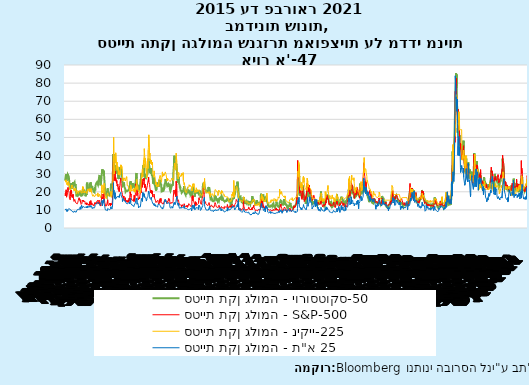
| Category | סטיית תקן גלומה - יורוסטוקס-50 | סטיית תקן גלומה - S&P-500 | סטיית תקן גלומה - ניקיי-225 | סטיית תקן גלומה - ת"א 25 |
|---|---|---|---|---|
| 2015-01-01 | 26.188 | 19.2 | 26.36 | 10.04 |
| 2015-01-02 | 26.253 | 17.79 | 26.36 | 10.04 |
| 2015-01-03 | 26.253 | 17.79 | 26.36 | 10.04 |
| 2015-01-04 | 26.253 | 17.79 | 26.36 | 10.18 |
| 2015-01-05 | 29.624 | 19.92 | 25.28 | 10.58 |
| 2015-01-06 | 28.832 | 21.12 | 26.59 | 10.55 |
| 2015-01-07 | 28.172 | 19.31 | 25.97 | 10.04 |
| 2015-01-08 | 25.909 | 17.01 | 25.05 | 9.17 |
| 2015-01-09 | 28.779 | 17.55 | 23.96 | 9.17 |
| 2015-01-10 | 28.779 | 17.55 | 23.96 | 9.17 |
| 2015-01-11 | 28.779 | 17.55 | 23.96 | 9.37 |
| 2015-01-12 | 29.725 | 19.6 | 23.96 | 10.04 |
| 2015-01-13 | 28.54 | 20.56 | 24.39 | 9.2 |
| 2015-01-14 | 29.484 | 21.48 | 25.18 | 9.57 |
| 2015-01-15 | 29.026 | 22.39 | 23.55 | 10.13 |
| 2015-01-16 | 29.329 | 20.95 | 25.68 | 10.13 |
| 2015-01-17 | 29.329 | 20.95 | 25.68 | 10.13 |
| 2015-01-18 | 29.329 | 20.95 | 25.68 | 9.73 |
| 2015-01-19 | 28.32 | 20.95 | 25.16 | 10.73 |
| 2015-01-20 | 27.072 | 19.89 | 24.74 | 10.74 |
| 2015-01-21 | 26.018 | 18.85 | 24.77 | 10.63 |
| 2015-01-22 | 22.944 | 16.4 | 24.14 | 10.35 |
| 2015-01-23 | 23.112 | 16.66 | 22.13 | 10.35 |
| 2015-01-24 | 23.112 | 16.66 | 22.13 | 10.35 |
| 2015-01-25 | 23.112 | 16.66 | 22.13 | 10.71 |
| 2015-01-26 | 21.343 | 15.52 | 21.99 | 10.47 |
| 2015-01-27 | 22.43 | 17.22 | 20.99 | 10.51 |
| 2015-01-28 | 21.826 | 20.44 | 20.54 | 10.45 |
| 2015-01-29 | 23.324 | 18.76 | 21.53 | 9.96 |
| 2015-01-30 | 24.731 | 20.97 | 21.63 | 9.96 |
| 2015-01-31 | 24.731 | 20.97 | 21.63 | 9.96 |
| 2015-02-01 | 24.731 | 20.97 | 21.63 | 9.86 |
| 2015-02-02 | 24.321 | 19.43 | 22.95 | 9.83 |
| 2015-02-03 | 22.764 | 17.33 | 23.75 | 9.27 |
| 2015-02-04 | 22.274 | 18.33 | 22.25 | 9.18 |
| 2015-02-05 | 22.261 | 16.85 | 22.69 | 8.88 |
| 2015-02-06 | 21.833 | 17.29 | 22.33 | 8.88 |
| 2015-02-07 | 21.833 | 17.29 | 22.33 | 8.88 |
| 2015-02-08 | 21.833 | 17.29 | 22.33 | 8.92 |
| 2015-02-09 | 25.371 | 18.55 | 22.33 | 9.14 |
| 2015-02-10 | 25.107 | 17.23 | 22.38 | 8.73 |
| 2015-02-11 | 25.721 | 16.96 | 22.53 | 8.54 |
| 2015-02-12 | 24.364 | 15.34 | 22.11 | 8.7 |
| 2015-02-13 | 24.185 | 14.69 | 20.53 | 8.7 |
| 2015-02-14 | 24.185 | 14.69 | 20.53 | 8.7 |
| 2015-02-15 | 24.185 | 14.69 | 20.53 | 8.3 |
| 2015-02-16 | 25.251 | 14.69 | 21.65 | 9.44 |
| 2015-02-17 | 24.905 | 15.8 | 21.23 | 9.8 |
| 2015-02-18 | 23.339 | 15.45 | 20.49 | 9.41 |
| 2015-02-19 | 23.209 | 15.29 | 20.93 | 8.84 |
| 2015-02-20 | 24.204 | 14.3 | 21.9 | 8.84 |
| 2015-02-21 | 24.204 | 14.3 | 21.9 | 8.84 |
| 2015-02-22 | 24.204 | 14.3 | 21.9 | 9.06 |
| 2015-02-23 | 20.625 | 14.56 | 21.77 | 9.1 |
| 2015-02-24 | 18.398 | 13.69 | 19.93 | 8.79 |
| 2015-02-25 | 17.824 | 13.84 | 18.78 | 8.5 |
| 2015-02-26 | 17.352 | 13.91 | 19.45 | 9.43 |
| 2015-02-27 | 17.753 | 13.34 | 20.28 | 9.43 |
| 2015-02-28 | 17.753 | 13.34 | 20.28 | 9.43 |
| 2015-03-01 | 17.753 | 13.34 | 20.28 | 10.09 |
| 2015-03-02 | 17.799 | 13.04 | 20.4 | 9.71 |
| 2015-03-03 | 19.584 | 13.86 | 20.07 | 10.49 |
| 2015-03-04 | 18.919 | 14.23 | 20.6 | 10.35 |
| 2015-03-05 | 18.184 | 14.04 | 19.85 | 10.35 |
| 2015-03-06 | 18.415 | 15.2 | 19.11 | 10.35 |
| 2015-03-07 | 18.415 | 15.2 | 19.11 | 10.35 |
| 2015-03-08 | 18.415 | 15.2 | 19.11 | 10.61 |
| 2015-03-09 | 18.811 | 15.06 | 19.58 | 10.52 |
| 2015-03-10 | 20.465 | 16.69 | 20.49 | 10.58 |
| 2015-03-11 | 19.47 | 16.87 | 20.82 | 10.09 |
| 2015-03-12 | 18.967 | 15.42 | 20.12 | 10.72 |
| 2015-03-13 | 18.826 | 16 | 20.21 | 10.72 |
| 2015-03-14 | 18.826 | 16 | 20.21 | 10.72 |
| 2015-03-15 | 18.826 | 16 | 20.21 | 11.23 |
| 2015-03-16 | 19.389 | 15.61 | 20.6 | 11.71 |
| 2015-03-17 | 20.248 | 15.66 | 20.24 | 11.71 |
| 2015-03-18 | 19.694 | 13.97 | 20.8 | 10.31 |
| 2015-03-19 | 18.914 | 14.07 | 20.29 | 11.11 |
| 2015-03-20 | 17.477 | 13.02 | 19.32 | 11.11 |
| 2015-03-21 | 17.477 | 13.02 | 19.32 | 11.11 |
| 2015-03-22 | 17.477 | 13.02 | 19.32 | 12.54 |
| 2015-03-23 | 19.832 | 13.41 | 19.45 | 12.53 |
| 2015-03-24 | 17.668 | 13.62 | 19.86 | 11.64 |
| 2015-03-25 | 19.158 | 15.44 | 19.3 | 10.89 |
| 2015-03-26 | 19.654 | 15.8 | 21.24 | 11.36 |
| 2015-03-27 | 20.472 | 15.07 | 22.86 | 11.36 |
| 2015-03-28 | 20.472 | 15.07 | 22.86 | 11.36 |
| 2015-03-29 | 20.472 | 15.07 | 22.86 | 11.31 |
| 2015-03-30 | 19.761 | 14.51 | 21.48 | 11.94 |
| 2015-03-31 | 21.1 | 15.29 | 22.71 | 11.94 |
| 2015-04-01 | 20.969 | 15.11 | 22.53 | 11.81 |
| 2015-04-02 | 20.72 | 14.67 | 20.76 | 11.42 |
| 2015-04-03 | 20.72 | 14.67 | 19.37 | 11.42 |
| 2015-04-04 | 20.72 | 14.67 | 19.37 | 11.42 |
| 2015-04-05 | 20.72 | 14.67 | 19.37 | 11.81 |
| 2015-04-06 | 20.72 | 14.74 | 20.41 | 11.73 |
| 2015-04-07 | 20.056 | 14.78 | 19.97 | 11.03 |
| 2015-04-08 | 19.428 | 13.98 | 19.55 | 11.4 |
| 2015-04-09 | 18.314 | 13.09 | 19.32 | 11.4 |
| 2015-04-10 | 17.512 | 12.58 | 20.05 | 11.4 |
| 2015-04-11 | 17.512 | 12.58 | 20.05 | 11.4 |
| 2015-04-12 | 17.512 | 12.58 | 20.05 | 11.39 |
| 2015-04-13 | 17.864 | 13.94 | 20.27 | 11.47 |
| 2015-04-14 | 18.858 | 13.67 | 20.37 | 11.74 |
| 2015-04-15 | 18.207 | 12.84 | 19.75 | 11.86 |
| 2015-04-16 | 20.109 | 12.6 | 19.13 | 11.05 |
| 2015-04-17 | 25.055 | 13.89 | 19.73 | 11.05 |
| 2015-04-18 | 25.055 | 13.89 | 19.73 | 11.05 |
| 2015-04-19 | 25.055 | 13.89 | 19.73 | 12.18 |
| 2015-04-20 | 22.3 | 13.3 | 21.06 | 11.28 |
| 2015-04-21 | 22.399 | 13.25 | 20.34 | 11.48 |
| 2015-04-22 | 22.327 | 12.71 | 21.49 | 11.48 |
| 2015-04-23 | 22.572 | 12.48 | 21.45 | 11.48 |
| 2015-04-24 | 21.92 | 12.29 | 20.99 | 11.48 |
| 2015-04-25 | 21.92 | 12.29 | 20.99 | 11.48 |
| 2015-04-26 | 21.92 | 12.29 | 20.99 | 11.85 |
| 2015-04-27 | 20.886 | 13.12 | 20.99 | 12.02 |
| 2015-04-28 | 22.12 | 12.41 | 21.71 | 12.25 |
| 2015-04-29 | 24.047 | 13.39 | 21.08 | 11.59 |
| 2015-04-30 | 24.213 | 14.55 | 21.29 | 11.62 |
| 2015-05-01 | 24.213 | 12.7 | 19.91 | 11.62 |
| 2015-05-02 | 24.213 | 12.7 | 19.91 | 11.62 |
| 2015-05-03 | 24.213 | 12.7 | 19.91 | 11.87 |
| 2015-05-04 | 23.426 | 12.85 | 21.08 | 11.56 |
| 2015-05-05 | 25.224 | 14.31 | 21.29 | 12.04 |
| 2015-05-06 | 24.723 | 15.15 | 19.91 | 12.42 |
| 2015-05-07 | 23.753 | 15.13 | 21.77 | 11.55 |
| 2015-05-08 | 21.13 | 12.86 | 20.57 | 11.55 |
| 2015-05-09 | 21.13 | 12.86 | 20.57 | 11.55 |
| 2015-05-10 | 21.13 | 12.86 | 20.57 | 11.1 |
| 2015-05-11 | 21.836 | 13.85 | 19.18 | 11.32 |
| 2015-05-12 | 23.233 | 13.86 | 19.05 | 11.71 |
| 2015-05-13 | 23.055 | 13.76 | 18.27 | 10.67 |
| 2015-05-14 | 21.742 | 12.74 | 18.34 | 11.22 |
| 2015-05-15 | 21.509 | 12.38 | 17.54 | 11.22 |
| 2015-05-16 | 21.509 | 12.38 | 17.54 | 11.22 |
| 2015-05-17 | 21.509 | 12.38 | 17.54 | 11.36 |
| 2015-05-18 | 21.007 | 12.73 | 18.4 | 11.42 |
| 2015-05-19 | 20.054 | 12.85 | 18.38 | 11.75 |
| 2015-05-20 | 19.57 | 12.88 | 18.48 | 11.43 |
| 2015-05-21 | 19.53 | 12.11 | 18.7 | 10.89 |
| 2015-05-22 | 19.631 | 12.13 | 17.36 | 10.89 |
| 2015-05-23 | 19.631 | 12.13 | 17.36 | 10.89 |
| 2015-05-24 | 19.631 | 12.13 | 17.36 | 10.89 |
| 2015-05-25 | 19.631 | 12.13 | 17.42 | 11.47 |
| 2015-05-26 | 22.501 | 14.06 | 17.32 | 12.01 |
| 2015-05-27 | 20.818 | 13.27 | 17.58 | 12.41 |
| 2015-05-28 | 22.018 | 13.31 | 17.96 | 12.59 |
| 2015-05-29 | 23.539 | 13.84 | 18.45 | 12.59 |
| 2015-05-30 | 23.539 | 13.84 | 18.45 | 12.59 |
| 2015-05-31 | 23.539 | 13.84 | 18.45 | 13.03 |
| 2015-06-01 | 24.565 | 13.97 | 18.48 | 13.21 |
| 2015-06-02 | 24.511 | 14.24 | 18.13 | 13.37 |
| 2015-06-03 | 24.051 | 13.66 | 18.46 | 13.35 |
| 2015-06-04 | 24.45 | 14.71 | 18.29 | 13.77 |
| 2015-06-05 | 25.275 | 14.21 | 17.98 | 13.77 |
| 2015-06-06 | 25.275 | 14.21 | 17.98 | 13.77 |
| 2015-06-07 | 25.275 | 14.21 | 17.98 | 13.64 |
| 2015-06-08 | 25.604 | 15.29 | 17.62 | 13.48 |
| 2015-06-09 | 24.987 | 14.47 | 19.39 | 14.11 |
| 2015-06-10 | 23.829 | 13.22 | 19.53 | 14.32 |
| 2015-06-11 | 23.634 | 12.85 | 17.23 | 13.75 |
| 2015-06-12 | 25.259 | 13.78 | 17.45 | 13.75 |
| 2015-06-13 | 25.259 | 13.78 | 17.45 | 13.75 |
| 2015-06-14 | 25.259 | 13.78 | 17.45 | 13.88 |
| 2015-06-15 | 27.847 | 15.39 | 18.08 | 14.25 |
| 2015-06-16 | 28.745 | 14.81 | 18.28 | 13.43 |
| 2015-06-17 | 28.272 | 14.5 | 18.64 | 13.11 |
| 2015-06-18 | 28.428 | 13.19 | 18.84 | 12.53 |
| 2015-06-19 | 28.618 | 13.96 | 17.63 | 12.53 |
| 2015-06-20 | 28.618 | 13.96 | 17.63 | 12.53 |
| 2015-06-21 | 28.618 | 13.96 | 17.63 | 12.62 |
| 2015-06-22 | 23.544 | 12.74 | 17.53 | 12.54 |
| 2015-06-23 | 23.518 | 12.11 | 16.79 | 12.97 |
| 2015-06-24 | 24.935 | 13.26 | 17.74 | 12.97 |
| 2015-06-25 | 25.643 | 14.01 | 17.9 | 12.9 |
| 2015-06-26 | 26.717 | 14.02 | 18.42 | 12.9 |
| 2015-06-27 | 26.717 | 14.02 | 18.42 | 12.9 |
| 2015-06-28 | 26.717 | 14.02 | 18.42 | 15.12 |
| 2015-06-29 | 30.647 | 18.85 | 23.83 | 14.88 |
| 2015-06-30 | 32.307 | 18.23 | 21.37 | 14.49 |
| 2015-07-01 | 30.285 | 16.09 | 20.43 | 12.17 |
| 2015-07-02 | 31.672 | 16.79 | 19.33 | 12.35 |
| 2015-07-03 | 32.285 | 16.79 | 20.42 | 12.35 |
| 2015-07-04 | 32.285 | 16.79 | 20.42 | 12.35 |
| 2015-07-05 | 32.285 | 16.79 | 20.42 | 15.33 |
| 2015-07-06 | 29.982 | 17.01 | 21.28 | 14.21 |
| 2015-07-07 | 30.988 | 16.09 | 18.85 | 14.45 |
| 2015-07-08 | 31.635 | 19.66 | 23.62 | 15.75 |
| 2015-07-09 | 30.766 | 19.97 | 23.79 | 13.92 |
| 2015-07-10 | 27.876 | 16.83 | 24.67 | 13.92 |
| 2015-07-11 | 27.876 | 16.83 | 24.67 | 13.92 |
| 2015-07-12 | 27.876 | 16.83 | 24.67 | 14.26 |
| 2015-07-13 | 23.248 | 13.9 | 22.17 | 11.73 |
| 2015-07-14 | 21.549 | 13.37 | 19.12 | 10.94 |
| 2015-07-15 | 21.097 | 13.23 | 17.95 | 10.54 |
| 2015-07-16 | 19.018 | 12.11 | 16.53 | 9.97 |
| 2015-07-17 | 18.966 | 11.95 | 16.59 | 9.97 |
| 2015-07-18 | 18.966 | 11.95 | 16.59 | 9.97 |
| 2015-07-19 | 18.966 | 11.95 | 16.59 | 9.72 |
| 2015-07-20 | 18.117 | 12.25 | 16.59 | 9.83 |
| 2015-07-21 | 17.914 | 12.22 | 16.16 | 9.82 |
| 2015-07-22 | 18.16 | 12.12 | 17.38 | 9.91 |
| 2015-07-23 | 17.432 | 12.64 | 17.12 | 9.6 |
| 2015-07-24 | 19.041 | 13.74 | 18.35 | 9.6 |
| 2015-07-25 | 19.041 | 13.74 | 18.35 | 9.6 |
| 2015-07-26 | 19.041 | 13.74 | 18.35 | 9.6 |
| 2015-07-27 | 21.915 | 15.6 | 19.41 | 10.8 |
| 2015-07-28 | 20.809 | 13.44 | 19.74 | 10.84 |
| 2015-07-29 | 20.034 | 12.5 | 18.93 | 10.47 |
| 2015-07-30 | 20.235 | 12.13 | 17.98 | 10.35 |
| 2015-07-31 | 19.288 | 12.12 | 17.49 | 10.35 |
| 2015-08-01 | 19.288 | 12.12 | 17.49 | 10.35 |
| 2015-08-02 | 19.288 | 12.12 | 17.49 | 10.69 |
| 2015-08-03 | 18.594 | 12.56 | 17.65 | 10.45 |
| 2015-08-04 | 18.254 | 13 | 17.45 | 10.56 |
| 2015-08-05 | 17.548 | 12.51 | 17.28 | 10.1 |
| 2015-08-06 | 18.26 | 13.77 | 17.67 | 10.02 |
| 2015-08-07 | 18.707 | 13.39 | 17.44 | 10.02 |
| 2015-08-08 | 18.707 | 13.39 | 17.44 | 10.02 |
| 2015-08-09 | 18.707 | 13.39 | 17.44 | 10.58 |
| 2015-08-10 | 18.307 | 12.23 | 17.68 | 10.38 |
| 2015-08-11 | 20.401 | 13.71 | 17.89 | 10.72 |
| 2015-08-12 | 24.468 | 13.61 | 20.24 | 11.77 |
| 2015-08-13 | 23.243 | 13.49 | 18.72 | 10.72 |
| 2015-08-14 | 22.836 | 12.83 | 16.93 | 10.72 |
| 2015-08-15 | 22.836 | 12.83 | 16.93 | 10.72 |
| 2015-08-16 | 22.836 | 12.83 | 16.93 | 10.41 |
| 2015-08-17 | 22.381 | 13.02 | 16.72 | 10.46 |
| 2015-08-18 | 22.5 | 13.79 | 17.25 | 10.62 |
| 2015-08-19 | 23.712 | 15.25 | 19.19 | 11.3 |
| 2015-08-20 | 25.495 | 19.14 | 20.27 | 11.3 |
| 2015-08-21 | 30.21 | 28.03 | 24.19 | 11.3 |
| 2015-08-22 | 30.21 | 28.03 | 24.19 | 11.3 |
| 2015-08-23 | 30.21 | 28.03 | 24.19 | 19.62 |
| 2015-08-24 | 40.803 | 40.74 | 36.18 | 25.01 |
| 2015-08-25 | 33.649 | 36.02 | 50.11 | 19.19 |
| 2015-08-26 | 35.29 | 30.32 | 36.22 | 20.85 |
| 2015-08-27 | 30.56 | 26.1 | 36.36 | 18.21 |
| 2015-08-28 | 31.034 | 26.05 | 29.81 | 18.21 |
| 2015-08-29 | 31.034 | 26.05 | 29.81 | 18.21 |
| 2015-08-30 | 31.034 | 26.05 | 29.81 | 16.37 |
| 2015-08-31 | 31.072 | 28.43 | 33.54 | 18.25 |
| 2015-09-01 | 34.264 | 31.4 | 39.92 | 19.54 |
| 2015-09-02 | 33.702 | 26.09 | 37.62 | 16.87 |
| 2015-09-03 | 29.877 | 25.61 | 36.13 | 15.84 |
| 2015-09-04 | 34.815 | 27.8 | 41.5 | 15.84 |
| 2015-09-05 | 34.815 | 27.8 | 41.5 | 15.84 |
| 2015-09-06 | 34.815 | 27.8 | 41.5 | 16.51 |
| 2015-09-07 | 35.154 | 27.8 | 35.78 | 16.95 |
| 2015-09-08 | 32.23 | 24.9 | 36.41 | 16.18 |
| 2015-09-09 | 30.45 | 26.23 | 33 | 17.05 |
| 2015-09-10 | 32.003 | 24.37 | 36.44 | 17.29 |
| 2015-09-11 | 31.648 | 23.2 | 31.88 | 17.29 |
| 2015-09-12 | 31.648 | 23.2 | 31.88 | 17.29 |
| 2015-09-13 | 31.648 | 23.2 | 31.88 | 17.29 |
| 2015-09-14 | 31.355 | 24.25 | 33.91 | 17.29 |
| 2015-09-15 | 29.95 | 22.54 | 32.28 | 17.29 |
| 2015-09-16 | 27.916 | 21.35 | 30.93 | 17.12 |
| 2015-09-17 | 27.065 | 21.14 | 29.29 | 17.67 |
| 2015-09-18 | 28.401 | 22.28 | 32.28 | 17.67 |
| 2015-09-19 | 28.401 | 22.28 | 32.28 | 17.67 |
| 2015-09-20 | 28.401 | 22.28 | 32.28 | 17.62 |
| 2015-09-21 | 27.017 | 20.14 | 30.93 | 16.81 |
| 2015-09-22 | 32.162 | 22.44 | 29.29 | 16.81 |
| 2015-09-23 | 31.056 | 22.13 | 29.26 | 16.81 |
| 2015-09-24 | 33.457 | 23.47 | 30.83 | 18.53 |
| 2015-09-25 | 30.518 | 23.62 | 29.17 | 18.53 |
| 2015-09-26 | 30.518 | 23.62 | 29.17 | 18.53 |
| 2015-09-27 | 30.518 | 23.62 | 29.17 | 18.53 |
| 2015-09-28 | 33.083 | 27.63 | 30.87 | 18.53 |
| 2015-09-29 | 33.737 | 26.83 | 34.89 | 19.71 |
| 2015-09-30 | 32.046 | 24.5 | 32.89 | 18.43 |
| 2015-10-01 | 31.717 | 22.55 | 33.54 | 17.62 |
| 2015-10-02 | 30.94 | 20.94 | 34.59 | 17.62 |
| 2015-10-03 | 30.94 | 20.94 | 34.59 | 17.62 |
| 2015-10-04 | 30.94 | 20.94 | 34.59 | 17.62 |
| 2015-10-05 | 28.619 | 19.54 | 33.28 | 17.62 |
| 2015-10-06 | 26.257 | 19.4 | 32.57 | 16.49 |
| 2015-10-07 | 26.391 | 18.4 | 29.4 | 14.62 |
| 2015-10-08 | 24.524 | 17.42 | 27.52 | 15.38 |
| 2015-10-09 | 23.417 | 17.08 | 25.99 | 15.38 |
| 2015-10-10 | 23.417 | 17.08 | 25.99 | 15.38 |
| 2015-10-11 | 23.417 | 17.08 | 25.99 | 15.72 |
| 2015-10-12 | 23.187 | 16.17 | 25.99 | 16.25 |
| 2015-10-13 | 24.04 | 17.67 | 25.87 | 16.43 |
| 2015-10-14 | 25.158 | 18.03 | 27.56 | 15.39 |
| 2015-10-15 | 24.119 | 16.05 | 26.89 | 14.83 |
| 2015-10-16 | 22.741 | 15.05 | 26.76 | 14.83 |
| 2015-10-17 | 22.741 | 15.05 | 26.76 | 14.83 |
| 2015-10-18 | 22.741 | 15.05 | 26.76 | 14.84 |
| 2015-10-19 | 22.452 | 14.98 | 27.74 | 15.06 |
| 2015-10-20 | 21.716 | 15.75 | 25.94 | 15.1 |
| 2015-10-21 | 21.83 | 16.7 | 25.5 | 14.55 |
| 2015-10-22 | 19.972 | 14.45 | 26.2 | 14.65 |
| 2015-10-23 | 19.801 | 14.46 | 26.68 | 14.65 |
| 2015-10-24 | 19.801 | 14.46 | 26.68 | 14.65 |
| 2015-10-25 | 19.801 | 14.46 | 26.68 | 13.65 |
| 2015-10-26 | 20.64 | 15.29 | 27.64 | 13.53 |
| 2015-10-27 | 20.686 | 15.43 | 28.36 | 13.66 |
| 2015-10-28 | 20.715 | 14.33 | 27.62 | 13.39 |
| 2015-10-29 | 21.042 | 14.61 | 26.49 | 13.39 |
| 2015-10-30 | 20.357 | 15.07 | 23.39 | 13.39 |
| 2015-10-31 | 20.357 | 15.07 | 23.39 | 13.39 |
| 2015-11-01 | 20.357 | 15.07 | 23.39 | 13.92 |
| 2015-11-02 | 20.767 | 14.15 | 23.39 | 13.79 |
| 2015-11-03 | 20.063 | 14.54 | 23.67 | 13.6 |
| 2015-11-04 | 20.746 | 15.51 | 23.37 | 13.62 |
| 2015-11-05 | 20.936 | 15.05 | 22.33 | 13.4 |
| 2015-11-06 | 20.436 | 14.33 | 22.41 | 13.4 |
| 2015-11-07 | 20.436 | 14.33 | 22.41 | 13.4 |
| 2015-11-08 | 20.436 | 14.33 | 22.41 | 13.73 |
| 2015-11-09 | 21.984 | 16.52 | 21.37 | 14.34 |
| 2015-11-10 | 22.392 | 15.29 | 20.92 | 14.17 |
| 2015-11-11 | 21.839 | 16.06 | 20.98 | 13.31 |
| 2015-11-12 | 23.448 | 18.37 | 20.17 | 14.28 |
| 2015-11-13 | 24.953 | 20.08 | 20.61 | 14.28 |
| 2015-11-14 | 24.953 | 20.08 | 20.61 | 14.28 |
| 2015-11-15 | 24.953 | 20.08 | 20.61 | 16.52 |
| 2015-11-16 | 25.849 | 18.16 | 23.78 | 14.21 |
| 2015-11-17 | 23.62 | 18.84 | 21.94 | 13.38 |
| 2015-11-18 | 24.748 | 16.85 | 22.77 | 13.01 |
| 2015-11-19 | 23.442 | 16.99 | 21.22 | 13.49 |
| 2015-11-20 | 22.653 | 15.47 | 20.43 | 13.49 |
| 2015-11-21 | 22.653 | 15.47 | 20.43 | 13.49 |
| 2015-11-22 | 22.653 | 15.47 | 20.43 | 12.61 |
| 2015-11-23 | 22.984 | 15.62 | 20.43 | 12.12 |
| 2015-11-24 | 24.813 | 15.93 | 20.17 | 12.85 |
| 2015-11-25 | 23.937 | 15.19 | 20.72 | 13 |
| 2015-11-26 | 22.89 | 15.19 | 20.44 | 12.57 |
| 2015-11-27 | 23.067 | 15.12 | 20.83 | 12.57 |
| 2015-11-28 | 23.067 | 15.12 | 20.83 | 12.57 |
| 2015-11-29 | 23.067 | 15.12 | 20.83 | 12.61 |
| 2015-11-30 | 23.65 | 16.13 | 21.68 | 12.72 |
| 2015-12-01 | 23.605 | 14.67 | 20.28 | 11.8 |
| 2015-12-02 | 22.818 | 15.91 | 20.24 | 11.41 |
| 2015-12-03 | 22.653 | 18.11 | 20.13 | 12.54 |
| 2015-12-04 | 22.682 | 14.81 | 21.81 | 12.54 |
| 2015-12-05 | 22.682 | 14.81 | 21.81 | 12.54 |
| 2015-12-06 | 22.682 | 14.81 | 21.81 | 12.5 |
| 2015-12-07 | 22.045 | 15.84 | 19.75 | 12.77 |
| 2015-12-08 | 23.573 | 17.6 | 21.09 | 13.79 |
| 2015-12-09 | 24.295 | 19.61 | 21.95 | 13.82 |
| 2015-12-10 | 24.534 | 19.34 | 22.73 | 14.22 |
| 2015-12-11 | 26.577 | 24.39 | 21.1 | 14.22 |
| 2015-12-12 | 26.577 | 24.39 | 21.1 | 14.22 |
| 2015-12-13 | 26.577 | 24.39 | 21.1 | 16.36 |
| 2015-12-14 | 30.411 | 22.73 | 23.97 | 15.65 |
| 2015-12-15 | 27.459 | 20.95 | 26.75 | 15.32 |
| 2015-12-16 | 25.436 | 17.86 | 24.71 | 16.39 |
| 2015-12-17 | 22.576 | 18.94 | 21.47 | 13.16 |
| 2015-12-18 | 23.899 | 20.7 | 23.4 | 13.16 |
| 2015-12-19 | 23.899 | 20.7 | 23.4 | 13.16 |
| 2015-12-20 | 23.899 | 20.7 | 23.4 | 13.82 |
| 2015-12-21 | 23.884 | 18.7 | 22.77 | 13.83 |
| 2015-12-22 | 22.536 | 16.6 | 20.45 | 13.76 |
| 2015-12-23 | 20.25 | 15.57 | 20.45 | 12.63 |
| 2015-12-24 | 20.25 | 15.74 | 20.76 | 11.08 |
| 2015-12-25 | 20.25 | 15.74 | 20.9 | 11.08 |
| 2015-12-26 | 20.25 | 15.74 | 20.9 | 11.08 |
| 2015-12-27 | 20.25 | 15.74 | 20.9 | 10.97 |
| 2015-12-28 | 22.454 | 16.91 | 20.26 | 11.76 |
| 2015-12-29 | 21.607 | 16.08 | 19.16 | 11.62 |
| 2015-12-30 | 22.174 | 17.29 | 19.45 | 11.52 |
| 2015-12-31 | 22.174 | 18.21 | 19.45 | 11.71 |
| 2016-01-01 | 22.174 | 18.21 | 19.45 | 11.71 |
| 2016-01-02 | 22.174 | 18.21 | 19.45 | 11.71 |
| 2016-01-03 | 22.174 | 18.21 | 19.45 | 12.25 |
| 2016-01-04 | 26.998 | 20.7 | 23.07 | 13.72 |
| 2016-01-05 | 26.209 | 19.34 | 23.35 | 13.73 |
| 2016-01-06 | 26.309 | 20.59 | 24.85 | 13.99 |
| 2016-01-07 | 29.79 | 24.99 | 28.14 | 16.3 |
| 2016-01-08 | 30.4 | 27.01 | 28.58 | 16.3 |
| 2016-01-09 | 30.4 | 27.01 | 28.58 | 16.3 |
| 2016-01-10 | 30.4 | 27.01 | 28.58 | 16.66 |
| 2016-01-11 | 30.218 | 24.3 | 28.58 | 15.79 |
| 2016-01-12 | 28.539 | 22.47 | 32.58 | 14.71 |
| 2016-01-13 | 28.135 | 25.22 | 28.13 | 14.92 |
| 2016-01-14 | 29.939 | 23.95 | 32.09 | 19.6 |
| 2016-01-15 | 34.586 | 27.02 | 33.39 | 19.6 |
| 2016-01-16 | 34.586 | 27.02 | 33.39 | 19.6 |
| 2016-01-17 | 34.586 | 27.02 | 33.39 | 19.39 |
| 2016-01-18 | 34.325 | 27.02 | 37.57 | 18.33 |
| 2016-01-19 | 30.757 | 26.05 | 33.17 | 17.43 |
| 2016-01-20 | 35.113 | 27.59 | 38.89 | 18.93 |
| 2016-01-21 | 31.789 | 26.69 | 43.8 | 19.29 |
| 2016-01-22 | 28.336 | 22.34 | 41.63 | 19.29 |
| 2016-01-23 | 28.336 | 22.34 | 41.63 | 19.29 |
| 2016-01-24 | 28.336 | 22.34 | 41.63 | 16.75 |
| 2016-01-25 | 28.444 | 24.15 | 36.28 | 16.7 |
| 2016-01-26 | 28.119 | 22.5 | 38.45 | 16.39 |
| 2016-01-27 | 27.783 | 23.11 | 38.34 | 16.99 |
| 2016-01-28 | 29.832 | 22.42 | 38.33 | 16.32 |
| 2016-01-29 | 27.389 | 20.2 | 33.72 | 16.32 |
| 2016-01-30 | 27.389 | 20.2 | 33.72 | 16.32 |
| 2016-01-31 | 27.389 | 20.2 | 33.72 | 14.88 |
| 2016-02-01 | 27.33 | 19.98 | 28.98 | 15.2 |
| 2016-02-02 | 29.154 | 21.98 | 27.75 | 15.65 |
| 2016-02-03 | 30.737 | 21.65 | 33.14 | 16.6 |
| 2016-02-04 | 29.642 | 21.84 | 33.88 | 16.16 |
| 2016-02-05 | 30.053 | 23.38 | 36.83 | 16.16 |
| 2016-02-06 | 30.053 | 23.38 | 36.83 | 16.16 |
| 2016-02-07 | 30.053 | 23.38 | 36.83 | 17.27 |
| 2016-02-08 | 33.392 | 26 | 32.89 | 18 |
| 2016-02-09 | 33.966 | 26.54 | 43.01 | 18.49 |
| 2016-02-10 | 33.453 | 26.29 | 44.47 | 18.03 |
| 2016-02-11 | 38.305 | 28.14 | 44.47 | 20.43 |
| 2016-02-12 | 35.685 | 25.4 | 51.45 | 20.43 |
| 2016-02-13 | 35.685 | 25.4 | 51.45 | 20.43 |
| 2016-02-14 | 35.685 | 25.4 | 51.45 | 18.84 |
| 2016-02-15 | 33.915 | 25.4 | 41.48 | 17.57 |
| 2016-02-16 | 33.521 | 24.11 | 39.66 | 17.88 |
| 2016-02-17 | 30.498 | 22.31 | 41.37 | 16.44 |
| 2016-02-18 | 30.917 | 21.64 | 36.92 | 16.66 |
| 2016-02-19 | 31.266 | 20.53 | 37.86 | 16.66 |
| 2016-02-20 | 31.266 | 20.53 | 37.86 | 16.66 |
| 2016-02-21 | 31.266 | 20.53 | 37.86 | 16.75 |
| 2016-02-22 | 29.95 | 19.38 | 35.55 | 15.73 |
| 2016-02-23 | 30.537 | 20.98 | 35.43 | 15.92 |
| 2016-02-24 | 33.118 | 20.72 | 37.49 | 16.99 |
| 2016-02-25 | 31.03 | 19.11 | 35.13 | 15.8 |
| 2016-02-26 | 29.276 | 19.81 | 34.99 | 15.8 |
| 2016-02-27 | 29.276 | 19.81 | 34.99 | 15.8 |
| 2016-02-28 | 29.276 | 19.81 | 34.99 | 14.64 |
| 2016-02-29 | 29.73 | 20.55 | 36.43 | 14.65 |
| 2016-03-01 | 28.542 | 17.7 | 34.72 | 14.44 |
| 2016-03-02 | 27.124 | 17.09 | 31.77 | 13.56 |
| 2016-03-03 | 26.519 | 16.7 | 29.88 | 13.22 |
| 2016-03-04 | 24.512 | 16.86 | 29.55 | 13.22 |
| 2016-03-05 | 24.512 | 16.86 | 29.55 | 13.22 |
| 2016-03-06 | 24.512 | 16.86 | 29.55 | 12.9 |
| 2016-03-07 | 26.205 | 17.35 | 28.03 | 12.96 |
| 2016-03-08 | 27.848 | 18.67 | 29.66 | 13.54 |
| 2016-03-09 | 28.061 | 18.34 | 31.55 | 13.01 |
| 2016-03-10 | 28.178 | 18.05 | 31.26 | 12.24 |
| 2016-03-11 | 24.111 | 16.5 | 29.14 | 12.24 |
| 2016-03-12 | 24.111 | 16.5 | 29.14 | 12.24 |
| 2016-03-13 | 24.111 | 16.5 | 29.14 | 12.48 |
| 2016-03-14 | 22.961 | 16.92 | 27.81 | 12.61 |
| 2016-03-15 | 23.242 | 16.84 | 25.58 | 12.89 |
| 2016-03-16 | 23.099 | 14.99 | 24.58 | 11.93 |
| 2016-03-17 | 22.754 | 14.44 | 23.86 | 11.47 |
| 2016-03-18 | 20.657 | 14.02 | 25.47 | 11.47 |
| 2016-03-19 | 20.657 | 14.02 | 25.47 | 11.47 |
| 2016-03-20 | 20.657 | 14.02 | 25.47 | 11.92 |
| 2016-03-21 | 21.826 | 13.79 | 25.47 | 12.05 |
| 2016-03-22 | 22.036 | 14.17 | 22.78 | 11.69 |
| 2016-03-23 | 22.097 | 14.94 | 22.77 | 11.53 |
| 2016-03-24 | 24.629 | 14.74 | 23.86 | 11.53 |
| 2016-03-25 | 24.629 | 14.74 | 23.13 | 11.53 |
| 2016-03-26 | 24.629 | 14.74 | 23.13 | 11.53 |
| 2016-03-27 | 24.629 | 14.74 | 23.13 | 12.59 |
| 2016-03-28 | 24.629 | 15.24 | 23.86 | 12.22 |
| 2016-03-29 | 24.904 | 13.82 | 23.84 | 13.18 |
| 2016-03-30 | 22.644 | 13.56 | 23.58 | 13.15 |
| 2016-03-31 | 23.449 | 13.95 | 22.94 | 13.11 |
| 2016-04-01 | 25.109 | 13.1 | 26.33 | 13.11 |
| 2016-04-02 | 25.109 | 13.1 | 26.33 | 13.11 |
| 2016-04-03 | 25.109 | 13.1 | 26.33 | 12.9 |
| 2016-04-04 | 24.509 | 14.12 | 26.6 | 12.94 |
| 2016-04-05 | 26.623 | 15.42 | 28.34 | 12.72 |
| 2016-04-06 | 25.169 | 14.09 | 28.86 | 12.66 |
| 2016-04-07 | 26.157 | 16.16 | 29.01 | 12.38 |
| 2016-04-08 | 24.805 | 15.36 | 27.98 | 12.38 |
| 2016-04-09 | 24.805 | 15.36 | 27.98 | 12.38 |
| 2016-04-10 | 24.805 | 15.36 | 27.98 | 12.45 |
| 2016-04-11 | 24.886 | 16.26 | 27.58 | 12.26 |
| 2016-04-12 | 24.078 | 14.85 | 26.47 | 12.17 |
| 2016-04-13 | 22.312 | 13.84 | 25.31 | 10.93 |
| 2016-04-14 | 20.63 | 13.72 | 26.11 | 11.07 |
| 2016-04-15 | 20.549 | 13.62 | 26.64 | 11.07 |
| 2016-04-16 | 20.549 | 13.62 | 26.64 | 11.07 |
| 2016-04-17 | 20.549 | 13.62 | 26.64 | 10.89 |
| 2016-04-18 | 21.285 | 13.35 | 30.98 | 11.32 |
| 2016-04-19 | 20.362 | 13.24 | 28.38 | 10.44 |
| 2016-04-20 | 19.883 | 13.28 | 30.1 | 10.79 |
| 2016-04-21 | 20.311 | 13.95 | 29.77 | 10.82 |
| 2016-04-22 | 20.602 | 13.22 | 28.77 | 10.82 |
| 2016-04-23 | 20.602 | 13.22 | 28.77 | 10.82 |
| 2016-04-24 | 20.602 | 13.22 | 28.77 | 11.36 |
| 2016-04-25 | 21.839 | 14.08 | 29.78 | 12.34 |
| 2016-04-26 | 21.282 | 13.96 | 30.32 | 13.22 |
| 2016-04-27 | 21.284 | 13.77 | 29.03 | 13.91 |
| 2016-04-28 | 20.854 | 15.22 | 29.15 | 13.91 |
| 2016-04-29 | 24.033 | 15.7 | 29.15 | 13.91 |
| 2016-04-30 | 24.033 | 15.7 | 29.15 | 13.91 |
| 2016-05-01 | 24.033 | 15.7 | 29.15 | 15.72 |
| 2016-05-02 | 25.117 | 14.68 | 30.98 | 14.67 |
| 2016-05-03 | 26.41 | 15.6 | 30.98 | 15.53 |
| 2016-05-04 | 27.037 | 16.05 | 30.98 | 15.35 |
| 2016-05-05 | 25.934 | 15.91 | 30.98 | 14.94 |
| 2016-05-06 | 25.124 | 14.72 | 29.54 | 14.94 |
| 2016-05-07 | 25.124 | 14.72 | 29.54 | 14.94 |
| 2016-05-08 | 25.124 | 14.72 | 29.54 | 14.75 |
| 2016-05-09 | 24.956 | 14.57 | 27.03 | 14.73 |
| 2016-05-10 | 23.891 | 13.63 | 26.41 | 13.375 |
| 2016-05-11 | 23.86 | 14.69 | 27.15 | 13.375 |
| 2016-05-12 | 24.447 | 14.41 | 25.92 | 13.375 |
| 2016-05-13 | 23.596 | 15.04 | 27.4 | 13.375 |
| 2016-05-14 | 23.596 | 15.04 | 27.4 | 13.375 |
| 2016-05-15 | 23.596 | 15.04 | 27.4 | 13.96 |
| 2016-05-16 | 24.212 | 14.68 | 27.51 | 13.77 |
| 2016-05-17 | 24.474 | 15.57 | 26.57 | 13.67 |
| 2016-05-18 | 23.297 | 15.95 | 26.92 | 13.74 |
| 2016-05-19 | 24.382 | 16.33 | 26.68 | 13.89 |
| 2016-05-20 | 22.604 | 15.2 | 26.08 | 13.89 |
| 2016-05-21 | 22.604 | 15.2 | 26.08 | 13.89 |
| 2016-05-22 | 22.604 | 15.2 | 26.08 | 13.45 |
| 2016-05-23 | 23.293 | 15.82 | 26.46 | 13.12 |
| 2016-05-24 | 21.786 | 14.42 | 25.97 | 12.24 |
| 2016-05-25 | 21.06 | 13.9 | 26.05 | 11.44 |
| 2016-05-26 | 20.819 | 13.43 | 26.35 | 11.63 |
| 2016-05-27 | 20.463 | 13.12 | 25.74 | 11.63 |
| 2016-05-28 | 20.463 | 13.12 | 25.74 | 11.63 |
| 2016-05-29 | 20.463 | 13.12 | 25.74 | 10.85 |
| 2016-05-30 | 20.944 | 13.12 | 26.04 | 11.38 |
| 2016-05-31 | 22.115 | 14.19 | 25.81 | 11.63 |
| 2016-06-01 | 23.932 | 14.2 | 26.74 | 11.42 |
| 2016-06-02 | 23.107 | 13.63 | 27.52 | 11.6 |
| 2016-06-03 | 23.554 | 13.47 | 27.08 | 11.6 |
| 2016-06-04 | 23.554 | 13.47 | 27.08 | 11.6 |
| 2016-06-05 | 23.554 | 13.47 | 27.08 | 11.84 |
| 2016-06-06 | 24.053 | 13.65 | 27.65 | 11.37 |
| 2016-06-07 | 23.35 | 14.05 | 26.49 | 10.94 |
| 2016-06-08 | 24.317 | 14.08 | 26.22 | 11.27 |
| 2016-06-09 | 25.841 | 14.64 | 26.71 | 11.74 |
| 2016-06-10 | 30.225 | 17.03 | 25.96 | 11.74 |
| 2016-06-11 | 30.225 | 17.03 | 25.96 | 11.74 |
| 2016-06-12 | 30.225 | 17.03 | 25.96 | 11.74 |
| 2016-06-13 | 34.364 | 20.97 | 32.62 | 13.39 |
| 2016-06-14 | 38.335 | 20.5 | 32.94 | 14.04 |
| 2016-06-15 | 37.687 | 20.14 | 33.89 | 13.09 |
| 2016-06-16 | 39.898 | 19.37 | 35.87 | 14 |
| 2016-06-17 | 38.027 | 19.41 | 34.79 | 14 |
| 2016-06-18 | 38.027 | 19.41 | 34.79 | 14 |
| 2016-06-19 | 38.027 | 19.41 | 34.79 | 14.17 |
| 2016-06-20 | 34.221 | 18.37 | 32.96 | 12.96 |
| 2016-06-21 | 34.468 | 18.48 | 32.21 | 13.75 |
| 2016-06-22 | 36.038 | 21.17 | 34.81 | 13.9 |
| 2016-06-23 | 32.056 | 17.25 | 34.98 | 14.8 |
| 2016-06-24 | 35.428 | 25.76 | 41.31 | 14.8 |
| 2016-06-25 | 35.428 | 25.76 | 41.31 | 14.8 |
| 2016-06-26 | 35.428 | 25.76 | 41.31 | 16.66 |
| 2016-06-27 | 34.999 | 23.85 | 36.17 | 17.61 |
| 2016-06-28 | 31.015 | 18.75 | 33.57 | 15.77 |
| 2016-06-29 | 28.553 | 16.64 | 29.58 | 14.23 |
| 2016-06-30 | 26.076 | 15.63 | 29.79 | 14.13 |
| 2016-07-01 | 25.02 | 14.77 | 28.29 | 14.13 |
| 2016-07-02 | 25.02 | 14.77 | 28.29 | 14.13 |
| 2016-07-03 | 25.02 | 14.77 | 28.29 | 12.51 |
| 2016-07-04 | 24.98 | 14.77 | 27.06 | 12.31 |
| 2016-07-05 | 26.706 | 15.58 | 27.82 | 12.06 |
| 2016-07-06 | 28.258 | 14.96 | 30.67 | 13.68 |
| 2016-07-07 | 26.545 | 14.76 | 30.07 | 12.17 |
| 2016-07-08 | 24.615 | 13.2 | 30.6 | 12.17 |
| 2016-07-09 | 24.615 | 13.2 | 30.6 | 12.17 |
| 2016-07-10 | 24.615 | 13.2 | 30.6 | 10.93 |
| 2016-07-11 | 23.57 | 13.54 | 29.63 | 11.09 |
| 2016-07-12 | 22.32 | 13.55 | 29.6 | 10.78 |
| 2016-07-13 | 23.092 | 13.04 | 29.79 | 10.41 |
| 2016-07-14 | 21.814 | 12.82 | 28.32 | 10.94 |
| 2016-07-15 | 20.92 | 12.67 | 28.81 | 10.94 |
| 2016-07-16 | 20.92 | 12.67 | 28.81 | 10.94 |
| 2016-07-17 | 20.92 | 12.67 | 28.81 | 11.42 |
| 2016-07-18 | 20.836 | 12.44 | 28.81 | 11.64 |
| 2016-07-19 | 21.012 | 11.97 | 29.2 | 11.31 |
| 2016-07-20 | 20.345 | 11.77 | 28.62 | 10.98 |
| 2016-07-21 | 19.45 | 12.74 | 30.07 | 11.06 |
| 2016-07-22 | 19.116 | 12.02 | 29.19 | 11.06 |
| 2016-07-23 | 19.116 | 12.02 | 29.19 | 11.06 |
| 2016-07-24 | 19.116 | 12.02 | 29.19 | 11.07 |
| 2016-07-25 | 19.918 | 12.87 | 29.17 | 11.28 |
| 2016-07-26 | 20.136 | 13.05 | 29.71 | 11.24 |
| 2016-07-27 | 20.533 | 12.83 | 29.82 | 11.21 |
| 2016-07-28 | 20.993 | 12.72 | 30.6 | 11.08 |
| 2016-07-29 | 20.245 | 11.87 | 25.83 | 11.08 |
| 2016-07-30 | 20.245 | 11.87 | 25.83 | 11.08 |
| 2016-07-31 | 20.245 | 11.87 | 25.83 | 10.58 |
| 2016-08-01 | 20.33 | 12.44 | 24.7 | 10.93 |
| 2016-08-02 | 23.123 | 13.37 | 23.85 | 12.36 |
| 2016-08-03 | 22.951 | 12.86 | 24.94 | 12.16 |
| 2016-08-04 | 21.413 | 12.42 | 23.59 | 10.84 |
| 2016-08-05 | 19.302 | 11.39 | 21.52 | 10.84 |
| 2016-08-06 | 19.302 | 11.39 | 21.52 | 10.84 |
| 2016-08-07 | 19.302 | 11.39 | 21.52 | 10.46 |
| 2016-08-08 | 18.938 | 11.5 | 19.83 | 10.91 |
| 2016-08-09 | 18.29 | 11.66 | 19.55 | 10.84 |
| 2016-08-10 | 19.19 | 12.05 | 19.42 | 11.29 |
| 2016-08-11 | 18.359 | 11.68 | 19.42 | 10.77 |
| 2016-08-12 | 17.898 | 11.55 | 19.42 | 10.77 |
| 2016-08-13 | 17.898 | 11.55 | 19.42 | 10.77 |
| 2016-08-14 | 17.898 | 11.55 | 19.42 | 10.77 |
| 2016-08-15 | 18.834 | 11.81 | 19.73 | 11.15 |
| 2016-08-16 | 20.068 | 12.64 | 20.85 | 10.76 |
| 2016-08-17 | 21.19 | 12.19 | 20.35 | 10.93 |
| 2016-08-18 | 20.32 | 11.43 | 22.48 | 10.25 |
| 2016-08-19 | 21.131 | 11.34 | 22.1 | 10.25 |
| 2016-08-20 | 21.131 | 11.34 | 22.1 | 10.25 |
| 2016-08-21 | 21.131 | 11.34 | 22.1 | 10.5 |
| 2016-08-22 | 21.665 | 12.27 | 22.01 | 10.31 |
| 2016-08-23 | 20.223 | 12.38 | 22.38 | 10.41 |
| 2016-08-24 | 19.831 | 13.45 | 22.7 | 10.11 |
| 2016-08-25 | 20.41 | 13.63 | 23.08 | 9.9 |
| 2016-08-26 | 19.489 | 13.65 | 23.89 | 9.9 |
| 2016-08-27 | 19.489 | 13.65 | 23.89 | 9.9 |
| 2016-08-28 | 19.489 | 13.65 | 23.89 | 9.9 |
| 2016-08-29 | 20.185 | 12.94 | 23.62 | 10.37 |
| 2016-08-30 | 19.372 | 13.12 | 22.88 | 10.31 |
| 2016-08-31 | 19.417 | 13.42 | 22.74 | 10.48 |
| 2016-09-01 | 20.064 | 13.48 | 23.25 | 10.84 |
| 2016-09-02 | 18.296 | 11.98 | 23.49 | 10.84 |
| 2016-09-03 | 18.296 | 11.98 | 23.49 | 10.84 |
| 2016-09-04 | 18.296 | 11.98 | 23.49 | 11.04 |
| 2016-09-05 | 18.411 | 11.98 | 23.03 | 10.29 |
| 2016-09-06 | 19.085 | 12.02 | 23.27 | 10.05 |
| 2016-09-07 | 18.574 | 11.94 | 22.24 | 9.45 |
| 2016-09-08 | 17.815 | 12.51 | 21.79 | 9.31 |
| 2016-09-09 | 19.299 | 17.5 | 20.43 | 9.31 |
| 2016-09-10 | 19.299 | 17.5 | 20.43 | 9.31 |
| 2016-09-11 | 19.299 | 17.5 | 20.43 | 12.5 |
| 2016-09-12 | 21.9 | 15.16 | 24.06 | 11.84 |
| 2016-09-13 | 22.781 | 17.85 | 22.52 | 12.26 |
| 2016-09-14 | 22.214 | 18.14 | 22.98 | 12.6 |
| 2016-09-15 | 20.551 | 16.3 | 24.47 | 12.19 |
| 2016-09-16 | 21.305 | 15.37 | 23.85 | 12.19 |
| 2016-09-17 | 21.305 | 15.37 | 23.85 | 12.19 |
| 2016-09-18 | 21.305 | 15.37 | 23.85 | 10.7 |
| 2016-09-19 | 20.318 | 15.53 | 23.85 | 11.18 |
| 2016-09-20 | 20.699 | 15.92 | 24.42 | 12.24 |
| 2016-09-21 | 20.092 | 13.3 | 21.27 | 12.97 |
| 2016-09-22 | 17.27 | 12.02 | 21.27 | 10.15 |
| 2016-09-23 | 16.829 | 12.29 | 19.43 | 10.15 |
| 2016-09-24 | 16.829 | 12.29 | 19.43 | 10.15 |
| 2016-09-25 | 16.829 | 12.29 | 19.43 | 10.38 |
| 2016-09-26 | 20.218 | 14.5 | 19.43 | 10.41 |
| 2016-09-27 | 20.657 | 13.1 | 19.43 | 10.41 |
| 2016-09-28 | 19.695 | 12.39 | 20.64 | 10.41 |
| 2016-09-29 | 19.96 | 14.02 | 19.77 | 11.25 |
| 2016-09-30 | 19.769 | 13.29 | 22.16 | 11.25 |
| 2016-10-01 | 19.769 | 13.29 | 22.16 | 11.25 |
| 2016-10-02 | 19.769 | 13.29 | 22.16 | 11.25 |
| 2016-10-03 | 20.395 | 13.57 | 20.89 | 11.25 |
| 2016-10-04 | 19.21 | 13.63 | 19.97 | 11.25 |
| 2016-10-05 | 19.444 | 12.99 | 20.55 | 11.22 |
| 2016-10-06 | 19.172 | 12.84 | 20.58 | 11.06 |
| 2016-10-07 | 20.039 | 13.48 | 20.46 | 11.06 |
| 2016-10-08 | 20.039 | 13.48 | 20.46 | 11.06 |
| 2016-10-09 | 20.039 | 13.48 | 20.46 | 10.86 |
| 2016-10-10 | 19.26 | 13.38 | 20.46 | 10.23 |
| 2016-10-11 | 19.879 | 15.36 | 20.22 | 10.23 |
| 2016-10-12 | 20.132 | 15.91 | 20.5 | 10.23 |
| 2016-10-13 | 20.927 | 16.69 | 21.19 | 12.66 |
| 2016-10-14 | 19.462 | 16.12 | 19.92 | 12.66 |
| 2016-10-15 | 19.462 | 16.12 | 19.92 | 12.66 |
| 2016-10-16 | 19.462 | 16.12 | 19.92 | 12.66 |
| 2016-10-17 | 20.623 | 16.21 | 19.79 | 12.66 |
| 2016-10-18 | 19.069 | 15.28 | 19.2 | 11.56 |
| 2016-10-19 | 18.072 | 14.41 | 19.05 | 10.37 |
| 2016-10-20 | 17.217 | 13.75 | 18.19 | 9.68 |
| 2016-10-21 | 16.599 | 13.34 | 18.29 | 9.68 |
| 2016-10-22 | 16.599 | 13.34 | 18.29 | 9.68 |
| 2016-10-23 | 16.599 | 13.34 | 18.29 | 9.68 |
| 2016-10-24 | 17.706 | 13.02 | 18.61 | 9.68 |
| 2016-10-25 | 18.226 | 13.46 | 18.04 | 10.48 |
| 2016-10-26 | 18.674 | 14.24 | 18.09 | 11.04 |
| 2016-10-27 | 18.732 | 15.36 | 18.39 | 11.45 |
| 2016-10-28 | 19.269 | 16.19 | 18.08 | 11.45 |
| 2016-10-29 | 19.269 | 16.19 | 18.08 | 11.45 |
| 2016-10-30 | 19.269 | 16.19 | 18.08 | 11.45 |
| 2016-10-31 | 21.445 | 17.06 | 18.91 | 12.3 |
| 2016-11-01 | 23.463 | 18.56 | 19.5 | 13.57 |
| 2016-11-02 | 23.655 | 19.32 | 22.59 | 15.04 |
| 2016-11-03 | 24.68 | 22.08 | 22.59 | 14.88 |
| 2016-11-04 | 25.208 | 22.51 | 25.44 | 14.88 |
| 2016-11-05 | 25.208 | 22.51 | 25.44 | 14.88 |
| 2016-11-06 | 25.208 | 22.51 | 25.44 | 15.74 |
| 2016-11-07 | 24.62 | 18.71 | 23.2 | 14.92 |
| 2016-11-08 | 24.934 | 18.74 | 22.6 | 16.9 |
| 2016-11-09 | 21.101 | 14.38 | 27.31 | 13.16 |
| 2016-11-10 | 21.096 | 14.74 | 21.44 | 11.78 |
| 2016-11-11 | 21.958 | 14.17 | 21.45 | 11.78 |
| 2016-11-12 | 21.958 | 14.17 | 21.45 | 11.78 |
| 2016-11-13 | 21.958 | 14.17 | 21.45 | 11.05 |
| 2016-11-14 | 22.194 | 14.48 | 21.61 | 10.99 |
| 2016-11-15 | 20.638 | 13.37 | 20.89 | 10.47 |
| 2016-11-16 | 21.115 | 13.72 | 20.49 | 10.19 |
| 2016-11-17 | 19.948 | 13.35 | 19.54 | 9.88 |
| 2016-11-18 | 20.37 | 12.85 | 19.46 | 9.88 |
| 2016-11-19 | 20.37 | 12.85 | 19.46 | 9.88 |
| 2016-11-20 | 20.37 | 12.85 | 19.46 | 10.03 |
| 2016-11-21 | 20.554 | 12.42 | 19.37 | 10.3 |
| 2016-11-22 | 20.247 | 12.41 | 19.22 | 9.92 |
| 2016-11-23 | 20.193 | 12.43 | 19.22 | 10.08 |
| 2016-11-24 | 20.029 | 12.43 | 19.36 | 9.76 |
| 2016-11-25 | 20.409 | 12.34 | 19.86 | 9.76 |
| 2016-11-26 | 20.409 | 12.34 | 19.86 | 9.76 |
| 2016-11-27 | 20.409 | 12.34 | 19.86 | 9.81 |
| 2016-11-28 | 22.533 | 13.15 | 20.01 | 10.17 |
| 2016-11-29 | 21.799 | 12.9 | 19.82 | 10.17 |
| 2016-11-30 | 21.437 | 13.33 | 19.26 | 10.29 |
| 2016-12-01 | 22.601 | 14.07 | 20.11 | 11.08 |
| 2016-12-02 | 22.616 | 14.12 | 18.6 | 11.08 |
| 2016-12-03 | 22.616 | 14.12 | 18.6 | 11.08 |
| 2016-12-04 | 22.616 | 14.12 | 18.6 | 11.94 |
| 2016-12-05 | 18.956 | 12.14 | 19.09 | 10.32 |
| 2016-12-06 | 17.634 | 11.79 | 17.93 | 10.1 |
| 2016-12-07 | 17.144 | 12.22 | 17.15 | 10.41 |
| 2016-12-08 | 16.159 | 12.64 | 19.39 | 9.69 |
| 2016-12-09 | 16.62 | 11.75 | 18.77 | 9.69 |
| 2016-12-10 | 16.62 | 11.75 | 18.77 | 9.69 |
| 2016-12-11 | 16.62 | 11.75 | 18.77 | 9.51 |
| 2016-12-12 | 16.932 | 12.64 | 19.08 | 9.3 |
| 2016-12-13 | 16.87 | 12.72 | 18.43 | 9.54 |
| 2016-12-14 | 17.115 | 13.19 | 18.5 | 9.83 |
| 2016-12-15 | 15.863 | 12.79 | 18.07 | 9.72 |
| 2016-12-16 | 15.098 | 12.2 | 18.32 | 9.72 |
| 2016-12-17 | 15.098 | 12.2 | 18.32 | 9.72 |
| 2016-12-18 | 15.098 | 12.2 | 18.32 | 9.61 |
| 2016-12-19 | 15.118 | 11.71 | 18.9 | 9.32 |
| 2016-12-20 | 14.875 | 11.45 | 17.69 | 9.4 |
| 2016-12-21 | 14.737 | 11.27 | 17.72 | 9.44 |
| 2016-12-22 | 14.877 | 11.43 | 17.5 | 9 |
| 2016-12-23 | 15.094 | 11.44 | 17.5 | 9 |
| 2016-12-24 | 15.094 | 11.44 | 17.5 | 9 |
| 2016-12-25 | 15.094 | 11.44 | 17.5 | 9.89 |
| 2016-12-26 | 15.094 | 11.44 | 17.97 | 9.72 |
| 2016-12-27 | 16.718 | 11.99 | 18.29 | 9.87 |
| 2016-12-28 | 17.065 | 12.95 | 18.02 | 9.92 |
| 2016-12-29 | 17.771 | 13.37 | 20.33 | 9.54 |
| 2016-12-30 | 18.123 | 14.04 | 21.17 | 9.54 |
| 2016-12-31 | 18.123 | 14.04 | 21.17 | 9.54 |
| 2017-01-01 | 18.123 | 14.04 | 21.17 | 10.02 |
| 2017-01-02 | 17.958 | 14.04 | 21.17 | 10.2 |
| 2017-01-03 | 17.352 | 12.85 | 21.17 | 10.35 |
| 2017-01-04 | 16.464 | 11.85 | 20.84 | 10.04 |
| 2017-01-05 | 15.98 | 11.67 | 20.31 | 9.61 |
| 2017-01-06 | 15.342 | 11.32 | 20.05 | 9.61 |
| 2017-01-07 | 15.342 | 11.32 | 20.05 | 9.61 |
| 2017-01-08 | 15.342 | 11.32 | 20.05 | 9.96 |
| 2017-01-09 | 15.514 | 11.56 | 20.05 | 9.94 |
| 2017-01-10 | 15.355 | 11.49 | 20.51 | 9.83 |
| 2017-01-11 | 15.701 | 11.26 | 20.09 | 9.84 |
| 2017-01-12 | 16.294 | 11.54 | 19.85 | 10.03 |
| 2017-01-13 | 14.862 | 11.23 | 17.97 | 10.03 |
| 2017-01-14 | 14.862 | 11.23 | 17.97 | 10.03 |
| 2017-01-15 | 14.862 | 11.23 | 17.97 | 9.77 |
| 2017-01-16 | 15.466 | 11.23 | 19.03 | 9.61 |
| 2017-01-17 | 15.667 | 11.87 | 20.9 | 9.96 |
| 2017-01-18 | 14.851 | 12.48 | 20.63 | 10.51 |
| 2017-01-19 | 14.848 | 12.78 | 20.16 | 11.03 |
| 2017-01-20 | 14.596 | 11.54 | 19.88 | 11.03 |
| 2017-01-21 | 14.596 | 11.54 | 19.88 | 11.03 |
| 2017-01-22 | 14.596 | 11.54 | 19.88 | 10.86 |
| 2017-01-23 | 17.111 | 11.77 | 20.55 | 11.36 |
| 2017-01-24 | 16.308 | 11.07 | 20.08 | 10.92 |
| 2017-01-25 | 15.696 | 10.81 | 18.73 | 10.27 |
| 2017-01-26 | 15.605 | 10.63 | 18.7 | 9.73 |
| 2017-01-27 | 15.847 | 10.58 | 18.51 | 9.73 |
| 2017-01-28 | 15.847 | 10.58 | 18.51 | 9.73 |
| 2017-01-29 | 15.847 | 10.58 | 18.51 | 9.38 |
| 2017-01-30 | 17.465 | 11.88 | 18.91 | 10.64 |
| 2017-01-31 | 17.368 | 11.99 | 20.72 | 10.62 |
| 2017-02-01 | 16.643 | 11.81 | 19.39 | 9.61 |
| 2017-02-02 | 16.194 | 11.93 | 20.44 | 9.95 |
| 2017-02-03 | 15.133 | 10.97 | 20.15 | 9.95 |
| 2017-02-04 | 15.133 | 10.97 | 20.15 | 9.95 |
| 2017-02-05 | 15.133 | 10.97 | 20.15 | 10.17 |
| 2017-02-06 | 16.433 | 11.37 | 19.98 | 10.28 |
| 2017-02-07 | 16.915 | 11.29 | 19.26 | 9.93 |
| 2017-02-08 | 16.831 | 11.45 | 18.08 | 10.43 |
| 2017-02-09 | 15.297 | 10.88 | 17.81 | 9.61 |
| 2017-02-10 | 15.112 | 10.85 | 18.5 | 9.61 |
| 2017-02-11 | 15.112 | 10.85 | 18.5 | 9.61 |
| 2017-02-12 | 15.112 | 10.85 | 18.5 | 9.35 |
| 2017-02-13 | 14.804 | 11.07 | 18.5 | 8.81 |
| 2017-02-14 | 14.647 | 10.74 | 18.5 | 8.93 |
| 2017-02-15 | 14.683 | 11.97 | 17.27 | 8.92 |
| 2017-02-16 | 15.4 | 11.76 | 17.26 | 9.15 |
| 2017-02-17 | 14.832 | 11.49 | 17.2 | 9.15 |
| 2017-02-18 | 14.832 | 11.49 | 17.2 | 9.15 |
| 2017-02-19 | 14.832 | 11.49 | 17.2 | 9 |
| 2017-02-20 | 14.891 | 11.49 | 17.35 | 9.09 |
| 2017-02-21 | 14.571 | 11.57 | 16.92 | 9.25 |
| 2017-02-22 | 14.858 | 11.74 | 16.82 | 9.64 |
| 2017-02-23 | 15.458 | 11.71 | 17.02 | 9.47 |
| 2017-02-24 | 15.855 | 11.47 | 17.13 | 9.47 |
| 2017-02-25 | 15.855 | 11.47 | 17.13 | 9.47 |
| 2017-02-26 | 15.855 | 11.47 | 17.13 | 9.87 |
| 2017-02-27 | 16.04 | 12.09 | 17.13 | 10.32 |
| 2017-02-28 | 16.285 | 12.92 | 17.13 | 11.27 |
| 2017-03-01 | 15.39 | 12.54 | 17.13 | 9.346 |
| 2017-03-02 | 15.275 | 11.81 | 17.13 | 9.9 |
| 2017-03-03 | 15.271 | 10.96 | 17.13 | 9.9 |
| 2017-03-04 | 15.271 | 10.96 | 17.13 | 9.9 |
| 2017-03-05 | 15.271 | 10.96 | 17.13 | 10.08 |
| 2017-03-06 | 15.768 | 11.24 | 15.18 | 10.79 |
| 2017-03-07 | 15.372 | 11.45 | 14.48 | 10.42 |
| 2017-03-08 | 14.975 | 11.86 | 14.77 | 9.96 |
| 2017-03-09 | 15.212 | 12.3 | 14.72 | 9.82 |
| 2017-03-10 | 15.344 | 11.66 | 14.66 | 9.82 |
| 2017-03-11 | 15.344 | 11.66 | 14.66 | 9.82 |
| 2017-03-12 | 15.344 | 11.66 | 14.66 | 9.82 |
| 2017-03-13 | 15.58 | 11.35 | 14.89 | 10.14 |
| 2017-03-14 | 15.974 | 12.3 | 15.41 | 10.04 |
| 2017-03-15 | 15.598 | 11.63 | 15.8 | 10.08 |
| 2017-03-16 | 11.518 | 11.21 | 14.53 | 10.55 |
| 2017-03-17 | 11.165 | 11.28 | 14.85 | 10.55 |
| 2017-03-18 | 11.165 | 11.28 | 14.85 | 10.55 |
| 2017-03-19 | 11.165 | 11.28 | 14.85 | 11.29 |
| 2017-03-20 | 13.08 | 11.34 | 14.85 | 10.99 |
| 2017-03-21 | 13.774 | 12.47 | 15.59 | 11.52 |
| 2017-03-22 | 14.515 | 12.81 | 18.64 | 11.75 |
| 2017-03-23 | 15.098 | 13.12 | 18.23 | 11.14 |
| 2017-03-24 | 15.198 | 12.96 | 17.81 | 11.14 |
| 2017-03-25 | 15.198 | 12.96 | 17.81 | 11.14 |
| 2017-03-26 | 15.198 | 12.96 | 17.81 | 12.14 |
| 2017-03-27 | 16.349 | 12.5 | 19.76 | 12.498 |
| 2017-03-28 | 15.864 | 11.53 | 17.93 | 12.2 |
| 2017-03-29 | 15.93 | 11.42 | 16.81 | 11.79 |
| 2017-03-30 | 16.104 | 11.54 | 17.64 | 11.79 |
| 2017-03-31 | 16.522 | 12.37 | 26.24 | 11.79 |
| 2017-04-01 | 16.522 | 12.37 | 26.24 | 11.79 |
| 2017-04-02 | 16.522 | 12.37 | 26.24 | 11.121 |
| 2017-04-03 | 17.96 | 12.38 | 17.16 | 11.244 |
| 2017-04-04 | 18.005 | 11.79 | 18.16 | 11.316 |
| 2017-04-05 | 18.52 | 12.89 | 18.14 | 10.073 |
| 2017-04-06 | 18.87 | 12.39 | 20.16 | 10.734 |
| 2017-04-07 | 19.537 | 12.87 | 20.46 | 10.734 |
| 2017-04-08 | 19.537 | 12.87 | 20.46 | 10.734 |
| 2017-04-09 | 19.537 | 12.87 | 20.46 | 11.007 |
| 2017-04-10 | 22.093 | 14.05 | 20.07 | 11.007 |
| 2017-04-11 | 22.952 | 15.07 | 21.6 | 11.007 |
| 2017-04-12 | 22.716 | 15.77 | 22.36 | 11.55 |
| 2017-04-13 | 23.388 | 15.96 | 22.77 | 12.299 |
| 2017-04-14 | 23.388 | 15.96 | 23.06 | 12.299 |
| 2017-04-15 | 23.388 | 15.96 | 23.06 | 12.299 |
| 2017-04-16 | 23.388 | 15.96 | 23.06 | 12.299 |
| 2017-04-17 | 23.388 | 14.66 | 22.15 | 12.299 |
| 2017-04-18 | 25.594 | 14.42 | 20.81 | 13.09 |
| 2017-04-19 | 24.202 | 14.93 | 20.39 | 11.604 |
| 2017-04-20 | 24.899 | 14.15 | 20.84 | 11.756 |
| 2017-04-21 | 25.093 | 14.63 | 20.13 | 11.756 |
| 2017-04-22 | 25.093 | 14.63 | 20.13 | 11.756 |
| 2017-04-23 | 25.093 | 14.63 | 20.13 | 16.108 |
| 2017-04-24 | 16.246 | 10.84 | 16.67 | 10.018 |
| 2017-04-25 | 15.42 | 10.76 | 15.47 | 10.196 |
| 2017-04-26 | 15.584 | 10.85 | 14.93 | 9.875 |
| 2017-04-27 | 16.107 | 10.36 | 14.56 | 9.772 |
| 2017-04-28 | 17.05 | 10.82 | 14.78 | 9.772 |
| 2017-04-29 | 17.05 | 10.82 | 14.78 | 9.772 |
| 2017-04-30 | 17.05 | 10.82 | 14.78 | 10.696 |
| 2017-05-01 | 17.05 | 10.11 | 14.93 | 10.696 |
| 2017-05-02 | 17.267 | 10.59 | 15.26 | 10.696 |
| 2017-05-03 | 17.398 | 10.68 | 15.26 | 10.107 |
| 2017-05-04 | 16.484 | 10.46 | 15.26 | 9.273 |
| 2017-05-05 | 17.014 | 10.57 | 15.26 | 9.273 |
| 2017-05-06 | 17.014 | 10.57 | 15.26 | 9.273 |
| 2017-05-07 | 17.014 | 10.57 | 15.26 | 9.813 |
| 2017-05-08 | 14.393 | 9.77 | 15 | 8.832 |
| 2017-05-09 | 14.087 | 9.96 | 14.64 | 8.671 |
| 2017-05-10 | 14.066 | 10.21 | 14.32 | 9.209 |
| 2017-05-11 | 14.349 | 10.6 | 14.11 | 9.106 |
| 2017-05-12 | 13.869 | 10.4 | 14.41 | 9.106 |
| 2017-05-13 | 13.869 | 10.4 | 14.41 | 9.106 |
| 2017-05-14 | 13.869 | 10.4 | 14.41 | 8.962 |
| 2017-05-15 | 14.204 | 10.42 | 14.46 | 8.875 |
| 2017-05-16 | 13.54 | 10.65 | 14.8 | 8.889 |
| 2017-05-17 | 16.144 | 15.59 | 16.11 | 9.264 |
| 2017-05-18 | 17.082 | 14.66 | 17.32 | 10.591 |
| 2017-05-19 | 15.468 | 12.04 | 17.12 | 10.591 |
| 2017-05-20 | 15.468 | 12.04 | 17.12 | 10.591 |
| 2017-05-21 | 15.468 | 12.04 | 17.12 | 9.529 |
| 2017-05-22 | 14.826 | 10.93 | 16.36 | 9.328 |
| 2017-05-23 | 13.843 | 10.72 | 16.05 | 8.802 |
| 2017-05-24 | 13.876 | 10.02 | 15.15 | 8.472 |
| 2017-05-25 | 13.96 | 9.99 | 14.73 | 8.951 |
| 2017-05-26 | 13.855 | 9.81 | 14.68 | 8.951 |
| 2017-05-27 | 13.855 | 9.81 | 14.68 | 8.951 |
| 2017-05-28 | 13.855 | 9.81 | 14.68 | 8.656 |
| 2017-05-29 | 14.178 | 9.81 | 14.73 | 8.751 |
| 2017-05-30 | 14.472 | 10.38 | 14.04 | 8.751 |
| 2017-05-31 | 14.554 | 10.41 | 13.85 | 8.751 |
| 2017-06-01 | 13.623 | 9.89 | 13.56 | 8.722 |
| 2017-06-02 | 13.334 | 9.75 | 14.61 | 8.722 |
| 2017-06-03 | 13.334 | 9.75 | 14.61 | 8.722 |
| 2017-06-04 | 13.334 | 9.75 | 14.61 | 8.391 |
| 2017-06-05 | 13.943 | 10.07 | 14.25 | 8.257 |
| 2017-06-06 | 14.386 | 10.45 | 14.41 | 8.844 |
| 2017-06-07 | 14.607 | 10.39 | 14.33 | 8.471 |
| 2017-06-08 | 14.08 | 10.16 | 14.05 | 8.361 |
| 2017-06-09 | 13.393 | 10.7 | 13.3 | 8.361 |
| 2017-06-10 | 13.393 | 10.7 | 13.3 | 8.361 |
| 2017-06-11 | 13.393 | 10.7 | 13.3 | 8.169 |
| 2017-06-12 | 14.51 | 11.46 | 13.87 | 8.803 |
| 2017-06-13 | 13.559 | 10.42 | 13.74 | 7.947 |
| 2017-06-14 | 13.946 | 10.64 | 13.94 | 7.97 |
| 2017-06-15 | 14.944 | 10.9 | 13.99 | 8.36 |
| 2017-06-16 | 13.744 | 10.38 | 13.17 | 8.36 |
| 2017-06-17 | 13.744 | 10.38 | 13.17 | 8.36 |
| 2017-06-18 | 13.744 | 10.38 | 13.17 | 7.664 |
| 2017-06-19 | 13.032 | 10.37 | 13.24 | 7.665 |
| 2017-06-20 | 14.029 | 10.86 | 13.42 | 7.586 |
| 2017-06-21 | 14.179 | 10.75 | 13.82 | 7.337 |
| 2017-06-22 | 14.033 | 10.48 | 13.92 | 7.126 |
| 2017-06-23 | 14.221 | 10.02 | 13.65 | 7.126 |
| 2017-06-24 | 14.221 | 10.02 | 13.65 | 7.126 |
| 2017-06-25 | 14.221 | 10.02 | 13.65 | 7.152 |
| 2017-06-26 | 13.657 | 9.9 | 13.6 | 7.214 |
| 2017-06-27 | 14.774 | 11.06 | 13.51 | 7.77 |
| 2017-06-28 | 14.852 | 10.03 | 13.86 | 7.444 |
| 2017-06-29 | 17.603 | 11.44 | 13.47 | 8.137 |
| 2017-06-30 | 17.253 | 11.18 | 15.49 | 8.137 |
| 2017-07-01 | 17.253 | 11.18 | 15.49 | 8.137 |
| 2017-07-02 | 17.253 | 11.18 | 15.49 | 8.286 |
| 2017-07-03 | 14.489 | 11.22 | 14.74 | 7.714 |
| 2017-07-04 | 14.393 | 11.22 | 15.77 | 7.795 |
| 2017-07-05 | 14.701 | 11.07 | 15.31 | 8.468 |
| 2017-07-06 | 15.472 | 12.54 | 16.05 | 8.656 |
| 2017-07-07 | 15.182 | 11.19 | 15.69 | 8.656 |
| 2017-07-08 | 15.182 | 11.19 | 15.69 | 8.656 |
| 2017-07-09 | 15.182 | 11.19 | 15.69 | 8.406 |
| 2017-07-10 | 14.783 | 11.11 | 14.05 | 7.836 |
| 2017-07-11 | 14.773 | 10.89 | 12.97 | 7.932 |
| 2017-07-12 | 13.748 | 10.3 | 13.51 | 7.91 |
| 2017-07-13 | 13.123 | 9.9 | 13.07 | 9.141 |
| 2017-07-14 | 12.65 | 9.51 | 12.36 | 9.141 |
| 2017-07-15 | 12.65 | 9.51 | 12.36 | 9.141 |
| 2017-07-16 | 12.65 | 9.51 | 12.36 | 8.629 |
| 2017-07-17 | 12.633 | 9.82 | 12.36 | 8.087 |
| 2017-07-18 | 13.684 | 9.89 | 13.25 | 8.466 |
| 2017-07-19 | 13.268 | 9.79 | 12.36 | 7.762 |
| 2017-07-20 | 13.088 | 9.58 | 12.25 | 8.18 |
| 2017-07-21 | 15.326 | 9.36 | 12.01 | 8.18 |
| 2017-07-22 | 15.326 | 9.36 | 12.01 | 8.18 |
| 2017-07-23 | 15.326 | 9.36 | 12.01 | 8.251 |
| 2017-07-24 | 15.083 | 9.43 | 13.09 | 8.267 |
| 2017-07-25 | 13.636 | 9.43 | 12.48 | 8.204 |
| 2017-07-26 | 12.997 | 9.6 | 12.06 | 7.366 |
| 2017-07-27 | 12.77 | 10.11 | 12.42 | 7.713 |
| 2017-07-28 | 13.733 | 10.29 | 13.86 | 7.713 |
| 2017-07-29 | 13.733 | 10.29 | 13.86 | 7.713 |
| 2017-07-30 | 13.733 | 10.29 | 13.86 | 7.729 |
| 2017-07-31 | 13.903 | 10.26 | 13.72 | 7.729 |
| 2017-08-01 | 13.472 | 10.09 | 13.22 | 7.729 |
| 2017-08-02 | 13.753 | 10.28 | 12.1 | 7.729 |
| 2017-08-03 | 13.73 | 10.44 | 12.44 | 8.944 |
| 2017-08-04 | 13.065 | 10.03 | 12.7 | 8.944 |
| 2017-08-05 | 13.065 | 10.03 | 12.7 | 8.944 |
| 2017-08-06 | 13.065 | 10.03 | 12.7 | 10.511 |
| 2017-08-07 | 13.199 | 9.93 | 12.47 | 10.547 |
| 2017-08-08 | 12.788 | 10.96 | 12.81 | 10.734 |
| 2017-08-09 | 15.015 | 11.11 | 15.93 | 11.164 |
| 2017-08-10 | 18.913 | 16.04 | 16.21 | 12.829 |
| 2017-08-11 | 19.31 | 15.51 | 16.21 | 12.829 |
| 2017-08-12 | 19.31 | 15.51 | 16.21 | 12.829 |
| 2017-08-13 | 19.31 | 15.51 | 16.21 | 13.8 |
| 2017-08-14 | 15.666 | 12.33 | 18.64 | 12.385 |
| 2017-08-15 | 14.88 | 12.04 | 15.83 | 11.013 |
| 2017-08-16 | 14.247 | 11.74 | 15.33 | 10.64 |
| 2017-08-17 | 15.386 | 15.55 | 14.99 | 11.123 |
| 2017-08-18 | 17.575 | 14.26 | 17.37 | 11.123 |
| 2017-08-19 | 17.575 | 14.26 | 17.37 | 11.123 |
| 2017-08-20 | 17.575 | 14.26 | 17.37 | 11.48 |
| 2017-08-21 | 18.555 | 13.19 | 17.42 | 10.706 |
| 2017-08-22 | 16.412 | 11.35 | 16.29 | 9.682 |
| 2017-08-23 | 16.228 | 12.25 | 15.48 | 9.982 |
| 2017-08-24 | 15.666 | 12.23 | 15.7 | 9.273 |
| 2017-08-25 | 15.326 | 11.28 | 15.03 | 9.273 |
| 2017-08-26 | 15.326 | 11.28 | 15.03 | 9.273 |
| 2017-08-27 | 15.326 | 11.28 | 15.03 | 9.951 |
| 2017-08-28 | 15.851 | 11.32 | 14.46 | 9.871 |
| 2017-08-29 | 17.317 | 11.7 | 15.23 | 11.053 |
| 2017-08-30 | 16.468 | 11.22 | 14.63 | 9.817 |
| 2017-08-31 | 15.632 | 10.59 | 14.9 | 8.861 |
| 2017-09-01 | 14.717 | 10.13 | 14.9 | 8.861 |
| 2017-09-02 | 14.717 | 10.13 | 14.9 | 8.861 |
| 2017-09-03 | 14.717 | 10.13 | 14.9 | 12.222 |
| 2017-09-04 | 16.212 | 10.13 | 16.41 | 11.077 |
| 2017-09-05 | 16.485 | 12.23 | 17.04 | 11.87 |
| 2017-09-06 | 16.379 | 11.63 | 17.54 | 10.913 |
| 2017-09-07 | 15.148 | 11.55 | 17.3 | 10.816 |
| 2017-09-08 | 15.199 | 12.12 | 19.32 | 10.816 |
| 2017-09-09 | 15.199 | 12.12 | 19.32 | 10.816 |
| 2017-09-10 | 15.199 | 12.12 | 19.32 | 11.366 |
| 2017-09-11 | 13.96 | 10.73 | 15.33 | 11.366 |
| 2017-09-12 | 13.446 | 10.58 | 13.62 | 8.792 |
| 2017-09-13 | 13.042 | 10.5 | 13.57 | 8.41 |
| 2017-09-14 | 12.274 | 10.44 | 13.83 | 8.346 |
| 2017-09-15 | 12.197 | 10.17 | 14.06 | 8.346 |
| 2017-09-16 | 12.197 | 10.17 | 14.06 | 8.346 |
| 2017-09-17 | 12.197 | 10.17 | 14.06 | 8.346 |
| 2017-09-18 | 11.943 | 10.15 | 14.06 | 8.491 |
| 2017-09-19 | 11.722 | 10.18 | 14.15 | 8.657 |
| 2017-09-20 | 11.795 | 9.78 | 14.04 | 8.657 |
| 2017-09-21 | 11.191 | 9.67 | 13.52 | 8.657 |
| 2017-09-22 | 11.708 | 9.59 | 13.69 | 8.657 |
| 2017-09-23 | 11.708 | 9.59 | 13.69 | 8.657 |
| 2017-09-24 | 11.708 | 9.59 | 13.69 | 9.275 |
| 2017-09-25 | 12.366 | 10.21 | 14.02 | 9.154 |
| 2017-09-26 | 12.541 | 10.17 | 14.98 | 8.844 |
| 2017-09-27 | 12.128 | 9.87 | 14.12 | 8.062 |
| 2017-09-28 | 12.126 | 9.55 | 14.51 | 8.705 |
| 2017-09-29 | 12.121 | 9.51 | 15.56 | 8.705 |
| 2017-09-30 | 12.121 | 9.51 | 15.56 | 8.705 |
| 2017-10-01 | 12.121 | 9.51 | 15.56 | 8.425 |
| 2017-10-02 | 12.174 | 9.45 | 15.41 | 8.493 |
| 2017-10-03 | 11.836 | 9.51 | 14.96 | 8.57 |
| 2017-10-04 | 12.775 | 9.63 | 15.61 | 8.57 |
| 2017-10-05 | 12.087 | 9.19 | 14.99 | 8.57 |
| 2017-10-06 | 12.506 | 9.65 | 14.86 | 8.57 |
| 2017-10-07 | 12.506 | 9.65 | 14.86 | 8.57 |
| 2017-10-08 | 12.506 | 9.65 | 14.86 | 8.226 |
| 2017-10-09 | 12.61 | 10.33 | 14.86 | 8.5 |
| 2017-10-10 | 13.394 | 10.08 | 15.02 | 8.129 |
| 2017-10-11 | 12.67 | 9.85 | 15.34 | 8.129 |
| 2017-10-12 | 12.325 | 9.91 | 15.34 | 8.129 |
| 2017-10-13 | 11.846 | 9.61 | 16.32 | 8.129 |
| 2017-10-14 | 11.846 | 9.61 | 16.32 | 8.129 |
| 2017-10-15 | 11.846 | 9.61 | 16.32 | 8.147 |
| 2017-10-16 | 11.904 | 9.91 | 16.64 | 8.048 |
| 2017-10-17 | 11.63 | 10.31 | 15.75 | 8.238 |
| 2017-10-18 | 11.051 | 10.07 | 14.95 | 7.934 |
| 2017-10-19 | 12.444 | 10.05 | 15.09 | 8.383 |
| 2017-10-20 | 12.217 | 9.97 | 16.03 | 8.383 |
| 2017-10-21 | 12.217 | 9.97 | 16.03 | 8.383 |
| 2017-10-22 | 12.217 | 9.97 | 16.03 | 7.645 |
| 2017-10-23 | 12.59 | 11.07 | 14.62 | 8.397 |
| 2017-10-24 | 12.942 | 11.16 | 14.88 | 8.302 |
| 2017-10-25 | 14.535 | 11.23 | 15.51 | 8.42 |
| 2017-10-26 | 12.916 | 11.3 | 15.23 | 8.324 |
| 2017-10-27 | 12.495 | 9.8 | 15 | 8.324 |
| 2017-10-28 | 12.495 | 9.8 | 15 | 8.324 |
| 2017-10-29 | 12.495 | 9.8 | 15 | 8.32 |
| 2017-10-30 | 12.831 | 10.5 | 15.23 | 8.273 |
| 2017-10-31 | 11.986 | 10.18 | 15.1 | 8.298 |
| 2017-11-01 | 11.792 | 10.2 | 16.32 | 8.296 |
| 2017-11-02 | 12.022 | 9.93 | 17.22 | 8.691 |
| 2017-11-03 | 11.564 | 9.14 | 17.22 | 8.691 |
| 2017-11-04 | 11.564 | 9.14 | 17.22 | 8.691 |
| 2017-11-05 | 11.564 | 9.14 | 17.22 | 9.254 |
| 2017-11-06 | 11.693 | 9.4 | 16.45 | 8.439 |
| 2017-11-07 | 12.134 | 9.89 | 16.51 | 8.969 |
| 2017-11-08 | 12.407 | 9.78 | 17.29 | 8.964 |
| 2017-11-09 | 13.916 | 10.5 | 21.38 | 9.529 |
| 2017-11-10 | 14.453 | 11.29 | 19.97 | 9.529 |
| 2017-11-11 | 14.453 | 11.29 | 19.97 | 9.529 |
| 2017-11-12 | 14.453 | 11.29 | 19.97 | 9.083 |
| 2017-11-13 | 14.382 | 11.5 | 19.28 | 9.062 |
| 2017-11-14 | 15.235 | 11.59 | 18.67 | 9.476 |
| 2017-11-15 | 15.578 | 13.13 | 19.7 | 10.046 |
| 2017-11-16 | 15.029 | 11.76 | 19.09 | 8.908 |
| 2017-11-17 | 14.743 | 11.43 | 20.13 | 8.908 |
| 2017-11-18 | 14.743 | 11.43 | 20.13 | 8.908 |
| 2017-11-19 | 14.743 | 11.43 | 20.13 | 9.504 |
| 2017-11-20 | 13.704 | 10.65 | 19.47 | 9.025 |
| 2017-11-21 | 12.936 | 9.73 | 18.28 | 8.153 |
| 2017-11-22 | 12.872 | 9.88 | 18.14 | 7.723 |
| 2017-11-23 | 12.73 | 9.88 | 18.14 | 9.332 |
| 2017-11-24 | 12.858 | 9.67 | 17.76 | 9.332 |
| 2017-11-25 | 12.858 | 9.67 | 17.76 | 9.332 |
| 2017-11-26 | 12.858 | 9.67 | 17.76 | 9.458 |
| 2017-11-27 | 13.546 | 9.87 | 17.75 | 8.985 |
| 2017-11-28 | 12.877 | 10.03 | 17.87 | 9.253 |
| 2017-11-29 | 13.544 | 10.7 | 17.47 | 9.464 |
| 2017-11-30 | 13.471 | 11.28 | 17.06 | 9.994 |
| 2017-12-01 | 16.012 | 11.43 | 17.41 | 9.994 |
| 2017-12-02 | 16.012 | 11.43 | 17.41 | 9.994 |
| 2017-12-03 | 16.012 | 11.43 | 17.41 | 10.396 |
| 2017-12-04 | 13.724 | 11.68 | 17.79 | 10.216 |
| 2017-12-05 | 13.159 | 11.33 | 16.76 | 9.847 |
| 2017-12-06 | 13.911 | 11.02 | 17.58 | 9.857 |
| 2017-12-07 | 13.451 | 10.16 | 16.21 | 9.862 |
| 2017-12-08 | 12.848 | 9.58 | 15.46 | 9.862 |
| 2017-12-09 | 12.848 | 9.58 | 15.46 | 9.862 |
| 2017-12-10 | 12.848 | 9.58 | 15.46 | 10.04 |
| 2017-12-11 | 12.924 | 9.34 | 15.29 | 9.95 |
| 2017-12-12 | 12.473 | 9.92 | 14.73 | 9.8 |
| 2017-12-13 | 12.734 | 10.18 | 14.77 | 9.966 |
| 2017-12-14 | 12.264 | 10.49 | 14.4 | 8.518 |
| 2017-12-15 | 11.792 | 9.42 | 14.53 | 8.518 |
| 2017-12-16 | 11.792 | 9.42 | 14.53 | 8.518 |
| 2017-12-17 | 11.792 | 9.42 | 14.53 | 8.362 |
| 2017-12-18 | 10.678 | 9.53 | 14.56 | 9.308 |
| 2017-12-19 | 11.197 | 10.03 | 14.45 | 9.191 |
| 2017-12-20 | 12.511 | 9.72 | 14.28 | 10.549 |
| 2017-12-21 | 11.737 | 9.62 | 13.76 | 10.89 |
| 2017-12-22 | 12.006 | 9.9 | 13.47 | 10.89 |
| 2017-12-23 | 12.006 | 9.9 | 13.47 | 10.89 |
| 2017-12-24 | 12.006 | 9.9 | 13.47 | 10.997 |
| 2017-12-25 | 12.006 | 9.9 | 14.11 | 10.198 |
| 2017-12-26 | 12.006 | 10.25 | 14.66 | 10.225 |
| 2017-12-27 | 12.714 | 10.47 | 15.18 | 9.203 |
| 2017-12-28 | 13.623 | 10.18 | 15.66 | 9.75 |
| 2017-12-29 | 13.511 | 11.04 | 16.01 | 9.75 |
| 2017-12-30 | 13.511 | 11.04 | 16.01 | 9.75 |
| 2017-12-31 | 13.511 | 11.04 | 16.01 | 9.938 |
| 2018-01-01 | 13.511 | 11.04 | 16.01 | 9.708 |
| 2018-01-02 | 13.368 | 9.77 | 16.01 | 9.349 |
| 2018-01-03 | 12.137 | 9.15 | 16.01 | 9.486 |
| 2018-01-04 | 11.41 | 9.22 | 15.46 | 9.162 |
| 2018-01-05 | 11.124 | 9.22 | 15.64 | 9.162 |
| 2018-01-06 | 11.124 | 9.22 | 15.64 | 9.162 |
| 2018-01-07 | 11.124 | 9.22 | 15.64 | 9.044 |
| 2018-01-08 | 11.495 | 9.52 | 15.64 | 9.357 |
| 2018-01-09 | 11.262 | 10.08 | 16.72 | 9.582 |
| 2018-01-10 | 11.759 | 9.82 | 16.16 | 10.055 |
| 2018-01-11 | 11.36 | 9.88 | 15.67 | 9.786 |
| 2018-01-12 | 10.902 | 10.16 | 14.89 | 9.786 |
| 2018-01-13 | 10.902 | 10.16 | 14.89 | 9.786 |
| 2018-01-14 | 10.902 | 10.16 | 14.89 | 9.344 |
| 2018-01-15 | 11.073 | 10.16 | 14.83 | 9.146 |
| 2018-01-16 | 11.347 | 11.66 | 14.7 | 9.21 |
| 2018-01-17 | 11.947 | 11.91 | 15.48 | 9.161 |
| 2018-01-18 | 11.988 | 12.22 | 16.11 | 9.218 |
| 2018-01-19 | 11.853 | 11.27 | 15.8 | 9.218 |
| 2018-01-20 | 11.853 | 11.27 | 15.8 | 9.218 |
| 2018-01-21 | 11.853 | 11.27 | 15.8 | 8.774 |
| 2018-01-22 | 11.968 | 11.03 | 16.31 | 8.706 |
| 2018-01-23 | 11.951 | 11.1 | 16.17 | 9.337 |
| 2018-01-24 | 12.392 | 11.47 | 16.29 | 8.332 |
| 2018-01-25 | 12.691 | 11.58 | 16.78 | 9.28 |
| 2018-01-26 | 12.478 | 11.08 | 16.65 | 9.28 |
| 2018-01-27 | 12.478 | 11.08 | 16.65 | 9.28 |
| 2018-01-28 | 12.478 | 11.08 | 16.65 | 8.928 |
| 2018-01-29 | 13.293 | 13.84 | 16.55 | 8.727 |
| 2018-01-30 | 14.811 | 14.79 | 17.6 | 9.156 |
| 2018-01-31 | 15.164 | 13.54 | 17.93 | 8.85 |
| 2018-02-01 | 16.139 | 13.47 | 17.03 | 9.023 |
| 2018-02-02 | 17.559 | 17.31 | 17.71 | 9.023 |
| 2018-02-03 | 17.559 | 17.31 | 17.71 | 9.023 |
| 2018-02-04 | 17.559 | 17.31 | 17.71 | 10.827 |
| 2018-02-05 | 18.855 | 37.32 | 20.46 | 11.067 |
| 2018-02-06 | 30.177 | 29.98 | 31.32 | 15.206 |
| 2018-02-07 | 21.366 | 27.73 | 31.23 | 13.312 |
| 2018-02-08 | 32.04 | 33.46 | 28.06 | 15.296 |
| 2018-02-09 | 34.737 | 29.06 | 36.57 | 15.296 |
| 2018-02-10 | 34.737 | 29.06 | 36.57 | 15.296 |
| 2018-02-11 | 34.737 | 29.06 | 36.57 | 16.987 |
| 2018-02-12 | 28.163 | 25.61 | 36.57 | 14.253 |
| 2018-02-13 | 25.95 | 24.97 | 34.46 | 12.014 |
| 2018-02-14 | 20.705 | 19.26 | 30.28 | 11.66 |
| 2018-02-15 | 20.516 | 19.13 | 25.32 | 11.302 |
| 2018-02-16 | 17.761 | 19.46 | 23.41 | 11.302 |
| 2018-02-17 | 17.761 | 19.46 | 23.41 | 11.302 |
| 2018-02-18 | 17.761 | 19.46 | 23.41 | 11.564 |
| 2018-02-19 | 19.128 | 19.46 | 22.2 | 11.322 |
| 2018-02-20 | 18.64 | 20.6 | 23.89 | 11.344 |
| 2018-02-21 | 18.649 | 20.02 | 22.91 | 10.252 |
| 2018-02-22 | 18.69 | 18.72 | 25.14 | 10.997 |
| 2018-02-23 | 18.175 | 16.49 | 22.06 | 10.997 |
| 2018-02-24 | 18.175 | 16.49 | 22.06 | 10.997 |
| 2018-02-25 | 18.175 | 16.49 | 22.06 | 10.053 |
| 2018-02-26 | 16.771 | 15.8 | 20.61 | 10.113 |
| 2018-02-27 | 17.594 | 18.59 | 21.02 | 10.325 |
| 2018-02-28 | 18 | 19.85 | 22.22 | 10.861 |
| 2018-03-01 | 20.567 | 22.47 | 24.68 | 10.861 |
| 2018-03-02 | 23.386 | 19.59 | 27.95 | 10.861 |
| 2018-03-03 | 23.386 | 19.59 | 27.95 | 10.861 |
| 2018-03-04 | 23.386 | 19.59 | 27.95 | 11.938 |
| 2018-03-05 | 18.892 | 18.73 | 28.62 | 12.881 |
| 2018-03-06 | 18.685 | 18.36 | 25.29 | 12.182 |
| 2018-03-07 | 18.155 | 17.76 | 27.81 | 12.643 |
| 2018-03-08 | 16.606 | 16.54 | 25.1 | 12.384 |
| 2018-03-09 | 15.405 | 14.64 | 24.32 | 12.384 |
| 2018-03-10 | 15.405 | 14.64 | 24.32 | 12.384 |
| 2018-03-11 | 15.405 | 14.64 | 24.32 | 10.791 |
| 2018-03-12 | 15.4 | 15.78 | 22.42 | 10.961 |
| 2018-03-13 | 16.62 | 16.35 | 21.28 | 11.133 |
| 2018-03-14 | 16.911 | 17.23 | 21.19 | 10.864 |
| 2018-03-15 | 15.225 | 16.59 | 21.05 | 10.544 |
| 2018-03-16 | 13.389 | 15.8 | 21.87 | 10.544 |
| 2018-03-17 | 13.389 | 15.8 | 21.87 | 10.544 |
| 2018-03-18 | 13.389 | 15.8 | 21.87 | 9.964 |
| 2018-03-19 | 16.499 | 19.02 | 21.93 | 10.433 |
| 2018-03-20 | 15.384 | 18.2 | 22.08 | 9.944 |
| 2018-03-21 | 14.853 | 17.86 | 22.08 | 11.788 |
| 2018-03-22 | 18.551 | 23.34 | 20.68 | 12.752 |
| 2018-03-23 | 21.076 | 24.87 | 27.49 | 12.752 |
| 2018-03-24 | 21.076 | 24.87 | 27.49 | 12.752 |
| 2018-03-25 | 21.076 | 24.87 | 27.49 | 16.854 |
| 2018-03-26 | 22.054 | 21.03 | 25.52 | 14.055 |
| 2018-03-27 | 18.976 | 22.5 | 22.68 | 12.003 |
| 2018-03-28 | 19.686 | 22.87 | 24.2 | 12.573 |
| 2018-03-29 | 17.436 | 19.97 | 23.85 | 13.192 |
| 2018-03-30 | 17.436 | 19.97 | 22.63 | 13.192 |
| 2018-03-31 | 17.436 | 19.97 | 22.63 | 13.192 |
| 2018-04-01 | 17.436 | 19.97 | 22.63 | 13.025 |
| 2018-04-02 | 17.436 | 23.62 | 22.96 | 13.575 |
| 2018-04-03 | 18.815 | 21.1 | 23 | 14.562 |
| 2018-04-04 | 19.576 | 20.06 | 22.34 | 17.279 |
| 2018-04-05 | 16.902 | 18.94 | 21.79 | 17.279 |
| 2018-04-06 | 17.437 | 21.49 | 22.83 | 17.279 |
| 2018-04-07 | 17.437 | 21.49 | 22.83 | 17.279 |
| 2018-04-08 | 17.437 | 21.49 | 22.83 | 15.381 |
| 2018-04-09 | 17.353 | 21.77 | 21.45 | 14.096 |
| 2018-04-10 | 16.316 | 20.47 | 21.12 | 13.569 |
| 2018-04-11 | 16.984 | 20.24 | 21.09 | 14.054 |
| 2018-04-12 | 15.811 | 18.49 | 19.83 | 14.157 |
| 2018-04-13 | 15.297 | 17.41 | 18.47 | 14.157 |
| 2018-04-14 | 15.297 | 17.41 | 18.47 | 14.157 |
| 2018-04-15 | 15.297 | 17.41 | 18.47 | 12.578 |
| 2018-04-16 | 14.504 | 16.56 | 17.87 | 10.59 |
| 2018-04-17 | 13.288 | 15.25 | 16.78 | 11.164 |
| 2018-04-18 | 13.038 | 15.6 | 16.89 | 11.164 |
| 2018-04-19 | 13.742 | 15.96 | 16.75 | 11.164 |
| 2018-04-20 | 13.756 | 16.88 | 15.93 | 11.164 |
| 2018-04-21 | 13.756 | 16.88 | 15.93 | 11.164 |
| 2018-04-22 | 13.756 | 16.88 | 15.93 | 11.559 |
| 2018-04-23 | 13.328 | 16.34 | 16.26 | 11.173 |
| 2018-04-24 | 13.409 | 18.02 | 16 | 12.157 |
| 2018-04-25 | 14.658 | 17.84 | 16.38 | 11.943 |
| 2018-04-26 | 13.678 | 16.24 | 16.82 | 13 |
| 2018-04-27 | 13.132 | 15.41 | 16 | 13 |
| 2018-04-28 | 13.132 | 15.41 | 16 | 13 |
| 2018-04-29 | 13.132 | 15.41 | 16 | 13.226 |
| 2018-04-30 | 13.715 | 15.93 | 16 | 15.787 |
| 2018-05-01 | 13.715 | 15.49 | 15.86 | 15.777 |
| 2018-05-02 | 13.528 | 15.97 | 15.03 | 11.72 |
| 2018-05-03 | 14.458 | 15.9 | 15.03 | 13.616 |
| 2018-05-04 | 13.42 | 14.77 | 15.03 | 13.616 |
| 2018-05-05 | 13.42 | 14.77 | 15.03 | 13.616 |
| 2018-05-06 | 13.42 | 14.77 | 15.03 | 12.333 |
| 2018-05-07 | 13.316 | 14.75 | 15.34 | 13.857 |
| 2018-05-08 | 13.716 | 14.71 | 14.67 | 15.718 |
| 2018-05-09 | 13.353 | 13.42 | 14.88 | 14.602 |
| 2018-05-10 | 12.823 | 13.23 | 14.62 | 14.006 |
| 2018-05-11 | 12.435 | 12.65 | 15.14 | 14.006 |
| 2018-05-12 | 12.435 | 12.65 | 15.14 | 14.006 |
| 2018-05-13 | 12.435 | 12.65 | 15.14 | 10.916 |
| 2018-05-14 | 12.645 | 12.93 | 14.48 | 11.493 |
| 2018-05-15 | 12.676 | 14.63 | 14.36 | 11.16 |
| 2018-05-16 | 13.572 | 13.42 | 15.22 | 11.075 |
| 2018-05-17 | 13.085 | 13.43 | 14.46 | 9.73 |
| 2018-05-18 | 13.967 | 13.42 | 14.49 | 9.73 |
| 2018-05-19 | 13.967 | 13.42 | 14.49 | 9.73 |
| 2018-05-20 | 13.967 | 13.42 | 14.49 | 9.73 |
| 2018-05-21 | 13.776 | 13.08 | 14.53 | 10.463 |
| 2018-05-22 | 12.984 | 13.22 | 14.24 | 9.511 |
| 2018-05-23 | 15.062 | 12.58 | 15.87 | 9.385 |
| 2018-05-24 | 15.69 | 12.53 | 16.98 | 10.052 |
| 2018-05-25 | 16.023 | 13.22 | 15.8 | 10.052 |
| 2018-05-26 | 16.023 | 13.22 | 15.8 | 10.052 |
| 2018-05-27 | 16.023 | 13.22 | 15.8 | 9.311 |
| 2018-05-28 | 17.779 | 13.22 | 15.04 | 10.319 |
| 2018-05-29 | 20.154 | 17.02 | 16.26 | 11.324 |
| 2018-05-30 | 18.341 | 14.94 | 19.25 | 10.89 |
| 2018-05-31 | 17.655 | 15.43 | 17.41 | 10.753 |
| 2018-06-01 | 15.623 | 13.46 | 16.88 | 10.753 |
| 2018-06-02 | 15.623 | 13.46 | 16.88 | 10.753 |
| 2018-06-03 | 15.623 | 13.46 | 16.88 | 9.875 |
| 2018-06-04 | 14.364 | 12.74 | 15.18 | 10.105 |
| 2018-06-05 | 14.799 | 12.4 | 14.74 | 9.963 |
| 2018-06-06 | 14.799 | 11.64 | 14.52 | 9.735 |
| 2018-06-07 | 14.42 | 12.13 | 15.02 | 9.758 |
| 2018-06-08 | 14.962 | 12.18 | 16.32 | 9.758 |
| 2018-06-09 | 14.962 | 12.18 | 16.32 | 9.758 |
| 2018-06-10 | 14.962 | 12.18 | 16.32 | 10.104 |
| 2018-06-11 | 13.992 | 12.35 | 15.54 | 9.63 |
| 2018-06-12 | 13.688 | 12.34 | 15.43 | 9.286 |
| 2018-06-13 | 13.198 | 12.94 | 14.68 | 9.08 |
| 2018-06-14 | 11.442 | 12.12 | 15.9 | 9.16 |
| 2018-06-15 | 12.13 | 11.98 | 15.12 | 9.16 |
| 2018-06-16 | 12.13 | 11.98 | 15.12 | 9.16 |
| 2018-06-17 | 12.13 | 11.98 | 15.12 | 9.275 |
| 2018-06-18 | 13.763 | 12.31 | 16.4 | 10.499 |
| 2018-06-19 | 14.868 | 13.35 | 20.11 | 11.208 |
| 2018-06-20 | 13.983 | 12.79 | 17.48 | 9.77 |
| 2018-06-21 | 16.09 | 14.64 | 16.81 | 9.517 |
| 2018-06-22 | 14.206 | 13.77 | 17.68 | 9.517 |
| 2018-06-23 | 14.206 | 13.77 | 17.68 | 9.517 |
| 2018-06-24 | 14.206 | 13.77 | 17.68 | 9.703 |
| 2018-06-25 | 17.873 | 17.33 | 18.86 | 11.623 |
| 2018-06-26 | 17.241 | 15.92 | 18.76 | 10.143 |
| 2018-06-27 | 17.18 | 17.91 | 19.02 | 9.735 |
| 2018-06-28 | 18.419 | 16.85 | 20.19 | 11.207 |
| 2018-06-29 | 16.633 | 16.09 | 19.77 | 11.207 |
| 2018-06-30 | 16.633 | 16.09 | 19.77 | 11.207 |
| 2018-07-01 | 16.633 | 16.09 | 19.77 | 11.218 |
| 2018-07-02 | 17.996 | 15.6 | 23.47 | 11.383 |
| 2018-07-03 | 16.391 | 16.14 | 21.36 | 10.114 |
| 2018-07-04 | 16.221 | 16.14 | 20.18 | 10.073 |
| 2018-07-05 | 15.731 | 14.97 | 20.73 | 10.372 |
| 2018-07-06 | 14.743 | 13.37 | 18.21 | 10.372 |
| 2018-07-07 | 14.743 | 13.37 | 18.21 | 10.372 |
| 2018-07-08 | 14.743 | 13.37 | 18.21 | 9.523 |
| 2018-07-09 | 14.071 | 12.69 | 16.77 | 8.899 |
| 2018-07-10 | 12.994 | 12.64 | 16.21 | 8.818 |
| 2018-07-11 | 14.596 | 13.63 | 17.89 | 9.012 |
| 2018-07-12 | 13.46 | 12.58 | 16.96 | 8.733 |
| 2018-07-13 | 12.804 | 12.18 | 16.33 | 8.733 |
| 2018-07-14 | 12.804 | 12.18 | 16.33 | 8.733 |
| 2018-07-15 | 12.804 | 12.18 | 16.33 | 9.133 |
| 2018-07-16 | 13.032 | 12.83 | 16.33 | 8.906 |
| 2018-07-17 | 12.556 | 12.06 | 16.46 | 8.7 |
| 2018-07-18 | 11.962 | 12.1 | 15.89 | 8.534 |
| 2018-07-19 | 12.848 | 12.87 | 15.78 | 8.5 |
| 2018-07-20 | 13.775 | 12.86 | 16.35 | 8.5 |
| 2018-07-21 | 13.775 | 12.86 | 16.35 | 8.5 |
| 2018-07-22 | 13.775 | 12.86 | 16.35 | 8.5 |
| 2018-07-23 | 14.189 | 12.62 | 18.25 | 8.445 |
| 2018-07-24 | 12.726 | 12.41 | 16.63 | 8.425 |
| 2018-07-25 | 13.503 | 12.29 | 16.19 | 8.883 |
| 2018-07-26 | 12.136 | 12.14 | 16.37 | 8.884 |
| 2018-07-27 | 11.659 | 13.03 | 15.99 | 8.884 |
| 2018-07-28 | 11.659 | 13.03 | 15.99 | 8.884 |
| 2018-07-29 | 11.659 | 13.03 | 15.99 | 9.722 |
| 2018-07-30 | 12.711 | 14.26 | 16.88 | 9.809 |
| 2018-07-31 | 12.56 | 12.83 | 15.65 | 10.023 |
| 2018-08-01 | 13.028 | 13.15 | 14.47 | 9.115 |
| 2018-08-02 | 14.505 | 12.19 | 16.24 | 9.225 |
| 2018-08-03 | 13.397 | 11.64 | 15.37 | 9.225 |
| 2018-08-04 | 13.397 | 11.64 | 15.37 | 9.225 |
| 2018-08-05 | 13.397 | 11.64 | 15.37 | 8.711 |
| 2018-08-06 | 13.47 | 11.27 | 15.4 | 8.836 |
| 2018-08-07 | 12.626 | 10.93 | 14.49 | 9.025 |
| 2018-08-08 | 12.865 | 10.85 | 14.38 | 8.638 |
| 2018-08-09 | 12.488 | 11.27 | 14.23 | 8.932 |
| 2018-08-10 | 15.111 | 13.16 | 16.03 | 8.932 |
| 2018-08-11 | 15.111 | 13.16 | 16.03 | 8.932 |
| 2018-08-12 | 15.111 | 13.16 | 16.03 | 8.785 |
| 2018-08-13 | 15.941 | 14.78 | 18.88 | 9.662 |
| 2018-08-14 | 15.861 | 13.31 | 15.95 | 9.608 |
| 2018-08-15 | 18.476 | 14.64 | 17.08 | 10.91 |
| 2018-08-16 | 16.263 | 13.45 | 17.75 | 8.95 |
| 2018-08-17 | 16.098 | 12.64 | 17.22 | 8.95 |
| 2018-08-18 | 16.098 | 12.64 | 17.22 | 8.95 |
| 2018-08-19 | 16.098 | 12.64 | 17.22 | 8.662 |
| 2018-08-20 | 14.502 | 12.49 | 17.04 | 9.688 |
| 2018-08-21 | 13.875 | 12.86 | 15.84 | 9.148 |
| 2018-08-22 | 13.851 | 12.25 | 15.38 | 9.626 |
| 2018-08-23 | 13.644 | 12.41 | 14.88 | 11.837 |
| 2018-08-24 | 13.188 | 11.99 | 14.46 | 11.837 |
| 2018-08-25 | 13.188 | 11.99 | 14.46 | 11.837 |
| 2018-08-26 | 13.188 | 11.99 | 14.46 | 11.349 |
| 2018-08-27 | 13.115 | 12.16 | 14.87 | 9.893 |
| 2018-08-28 | 13.16 | 12.5 | 14.71 | 9.856 |
| 2018-08-29 | 12.991 | 12.25 | 14.37 | 8.622 |
| 2018-08-30 | 14.153 | 13.53 | 14.83 | 10.043 |
| 2018-08-31 | 15.634 | 12.86 | 14.95 | 10.043 |
| 2018-09-01 | 15.634 | 12.86 | 14.95 | 10.043 |
| 2018-09-02 | 15.634 | 12.86 | 14.95 | 10.644 |
| 2018-09-03 | 15.494 | 12.86 | 15.47 | 10.637 |
| 2018-09-04 | 16.385 | 13.16 | 15.21 | 10.663 |
| 2018-09-05 | 17.289 | 13.91 | 16.61 | 12.407 |
| 2018-09-06 | 17.101 | 14.65 | 16.9 | 10.087 |
| 2018-09-07 | 16.455 | 14.88 | 16.88 | 10.087 |
| 2018-09-08 | 16.455 | 14.88 | 16.88 | 10.087 |
| 2018-09-09 | 16.455 | 14.88 | 16.88 | 10.087 |
| 2018-09-10 | 15.895 | 14.16 | 16.85 | 10.087 |
| 2018-09-11 | 15.786 | 13.22 | 16.3 | 10.087 |
| 2018-09-12 | 15.324 | 13.14 | 16.59 | 11.7 |
| 2018-09-13 | 14.593 | 12.37 | 16.62 | 11.069 |
| 2018-09-14 | 13.896 | 12.07 | 16.66 | 11.069 |
| 2018-09-15 | 13.896 | 12.07 | 16.66 | 11.069 |
| 2018-09-16 | 13.896 | 12.07 | 16.66 | 9.551 |
| 2018-09-17 | 14.571 | 13.68 | 16.66 | 9.636 |
| 2018-09-18 | 14.356 | 12.79 | 17.12 | 9.636 |
| 2018-09-19 | 13.53 | 11.75 | 16.61 | 9.636 |
| 2018-09-20 | 13.184 | 11.8 | 16.17 | 9.463 |
| 2018-09-21 | 12.815 | 11.68 | 16.2 | 9.463 |
| 2018-09-22 | 12.815 | 11.68 | 16.2 | 9.463 |
| 2018-09-23 | 12.815 | 11.68 | 16.2 | 9.463 |
| 2018-09-24 | 13.733 | 12.2 | 16.2 | 9.463 |
| 2018-09-25 | 13.164 | 12.42 | 16.58 | 12.461 |
| 2018-09-26 | 12.852 | 12.89 | 16.42 | 9.729 |
| 2018-09-27 | 13.171 | 12.41 | 16.37 | 10.605 |
| 2018-09-28 | 14.764 | 12.12 | 16.74 | 10.605 |
| 2018-09-29 | 14.764 | 12.12 | 16.74 | 10.605 |
| 2018-09-30 | 14.764 | 12.12 | 16.74 | 10.605 |
| 2018-10-01 | 14.233 | 12 | 16.98 | 10.605 |
| 2018-10-02 | 15.478 | 12.05 | 17.22 | 11.269 |
| 2018-10-03 | 14.606 | 11.61 | 17.13 | 10.755 |
| 2018-10-04 | 16.025 | 14.22 | 18.48 | 11.714 |
| 2018-10-05 | 16.681 | 14.82 | 18.28 | 11.714 |
| 2018-10-06 | 16.681 | 14.82 | 18.28 | 11.714 |
| 2018-10-07 | 16.681 | 14.82 | 18.28 | 12.067 |
| 2018-10-08 | 17.626 | 15.69 | 18.28 | 12.067 |
| 2018-10-09 | 16.9 | 15.95 | 19.33 | 12.542 |
| 2018-10-10 | 18.403 | 22.96 | 18.48 | 12.23 |
| 2018-10-11 | 21.237 | 24.98 | 27.11 | 16.603 |
| 2018-10-12 | 20.21 | 21.31 | 26.1 | 16.603 |
| 2018-10-13 | 20.21 | 21.31 | 26.1 | 16.603 |
| 2018-10-14 | 20.21 | 21.31 | 26.1 | 15.571 |
| 2018-10-15 | 19.07 | 21.3 | 28.49 | 16.136 |
| 2018-10-16 | 16.834 | 17.62 | 24.58 | 14.093 |
| 2018-10-17 | 17.016 | 17.4 | 21 | 12.879 |
| 2018-10-18 | 18.171 | 20.06 | 22.43 | 13.236 |
| 2018-10-19 | 18.784 | 19.89 | 22.36 | 13.236 |
| 2018-10-20 | 18.784 | 19.89 | 22.36 | 13.236 |
| 2018-10-21 | 18.784 | 19.89 | 22.36 | 14.209 |
| 2018-10-22 | 19.358 | 19.64 | 21.67 | 14.883 |
| 2018-10-23 | 21.362 | 20.71 | 26.11 | 17.242 |
| 2018-10-24 | 21.977 | 25.23 | 25.18 | 13.245 |
| 2018-10-25 | 20.755 | 24.22 | 29.25 | 14.954 |
| 2018-10-26 | 23.739 | 24.16 | 28.11 | 14.954 |
| 2018-10-27 | 23.739 | 24.16 | 28.11 | 14.954 |
| 2018-10-28 | 23.739 | 24.16 | 28.11 | 14.906 |
| 2018-10-29 | 22.287 | 24.7 | 28.13 | 15.29 |
| 2018-10-30 | 22.225 | 23.35 | 26.68 | 15.29 |
| 2018-10-31 | 20.304 | 21.23 | 26.23 | 13.924 |
| 2018-11-01 | 18.995 | 19.34 | 26.21 | 13.295 |
| 2018-11-02 | 18.848 | 19.51 | 26.67 | 13.295 |
| 2018-11-03 | 18.848 | 19.51 | 26.67 | 13.295 |
| 2018-11-04 | 18.848 | 19.51 | 26.67 | 13.856 |
| 2018-11-05 | 18.33 | 19.96 | 27.73 | 13.928 |
| 2018-11-06 | 18.109 | 19.91 | 25.72 | 13.222 |
| 2018-11-07 | 16.426 | 16.36 | 24.42 | 12.248 |
| 2018-11-08 | 15.881 | 16.72 | 20.63 | 12.986 |
| 2018-11-09 | 16.377 | 17.36 | 20.38 | 12.986 |
| 2018-11-10 | 16.377 | 17.36 | 20.38 | 12.986 |
| 2018-11-11 | 16.377 | 17.36 | 20.38 | 13.566 |
| 2018-11-12 | 17.859 | 20.45 | 19.41 | 13.519 |
| 2018-11-13 | 17.029 | 20.02 | 22.21 | 13.888 |
| 2018-11-14 | 18.455 | 21.25 | 22.31 | 12.99 |
| 2018-11-15 | 20.152 | 19.98 | 22.58 | 13.376 |
| 2018-11-16 | 18.076 | 18.14 | 22.65 | 13.376 |
| 2018-11-17 | 18.076 | 18.14 | 22.65 | 13.376 |
| 2018-11-18 | 18.076 | 18.14 | 22.65 | 12.79 |
| 2018-11-19 | 18.032 | 20.1 | 20.87 | 13.076 |
| 2018-11-20 | 19.962 | 22.48 | 21.31 | 14.845 |
| 2018-11-21 | 18.24 | 20.8 | 21.36 | 13.177 |
| 2018-11-22 | 19.288 | 20.8 | 20.39 | 13.86 |
| 2018-11-23 | 18.974 | 21.52 | 20.39 | 13.86 |
| 2018-11-24 | 18.974 | 21.52 | 20.39 | 13.86 |
| 2018-11-25 | 18.974 | 21.52 | 20.39 | 15.452 |
| 2018-11-26 | 18.423 | 18.9 | 20.62 | 13.441 |
| 2018-11-27 | 18.479 | 19.02 | 20.86 | 13.192 |
| 2018-11-28 | 18.595 | 18.49 | 20.71 | 10.594 |
| 2018-11-29 | 18.61 | 18.79 | 20.47 | 13.41 |
| 2018-11-30 | 18.494 | 18.07 | 20.57 | 13.41 |
| 2018-12-01 | 18.494 | 18.07 | 20.57 | 13.41 |
| 2018-12-02 | 18.494 | 18.07 | 20.57 | 13.166 |
| 2018-12-03 | 16.915 | 16.44 | 18.1 | 12.975 |
| 2018-12-04 | 17.208 | 20.74 | 19.55 | 14.459 |
| 2018-12-05 | 19.09 | 20.74 | 20.17 | 14.459 |
| 2018-12-06 | 24.616 | 21.19 | 23.39 | 16.152 |
| 2018-12-07 | 21.669 | 23.23 | 22.55 | 16.152 |
| 2018-12-08 | 21.669 | 23.23 | 22.55 | 16.152 |
| 2018-12-09 | 21.669 | 23.23 | 22.55 | 16.405 |
| 2018-12-10 | 23.659 | 22.64 | 25.57 | 17.516 |
| 2018-12-11 | 21.092 | 21.76 | 24.32 | 15.992 |
| 2018-12-12 | 19.725 | 21.46 | 22.3 | 15.988 |
| 2018-12-13 | 19.177 | 20.65 | 20.46 | 14.986 |
| 2018-12-14 | 19.164 | 21.63 | 22.84 | 14.986 |
| 2018-12-15 | 19.164 | 21.63 | 22.84 | 14.986 |
| 2018-12-16 | 19.164 | 21.63 | 22.84 | 16.12 |
| 2018-12-17 | 19.819 | 24.52 | 21.18 | 16.12 |
| 2018-12-18 | 20.037 | 25.58 | 23.37 | 16.744 |
| 2018-12-19 | 19.602 | 25.58 | 23.88 | 16.812 |
| 2018-12-20 | 20.733 | 28.38 | 27.37 | 17.478 |
| 2018-12-21 | 20.398 | 30.11 | 28.02 | 17.478 |
| 2018-12-22 | 20.398 | 30.11 | 28.02 | 17.478 |
| 2018-12-23 | 20.398 | 30.11 | 28.02 | 27.479 |
| 2018-12-24 | 20.398 | 36.07 | 28.02 | 27.796 |
| 2018-12-25 | 20.398 | 36.07 | 38.87 | 26.306 |
| 2018-12-26 | 20.398 | 30.41 | 35.21 | 21.809 |
| 2018-12-27 | 25.688 | 29.96 | 30.5 | 22.532 |
| 2018-12-28 | 23.864 | 28.34 | 32.65 | 22.532 |
| 2018-12-29 | 23.864 | 28.34 | 32.65 | 22.532 |
| 2018-12-30 | 23.864 | 28.34 | 32.65 | 22.192 |
| 2018-12-31 | 23.864 | 25.42 | 32.65 | 22.109 |
| 2019-01-01 | 23.864 | 25.42 | 32.65 | 18.922 |
| 2019-01-02 | 23.392 | 23.22 | 32.65 | 18.922 |
| 2019-01-03 | 22.998 | 25.45 | 32.65 | 22.356 |
| 2019-01-04 | 20.483 | 21.38 | 30.54 | 22.356 |
| 2019-01-05 | 20.483 | 21.38 | 30.54 | 22.356 |
| 2019-01-06 | 20.483 | 21.38 | 30.54 | 20.183 |
| 2019-01-07 | 20.151 | 21.4 | 28.38 | 20.352 |
| 2019-01-08 | 19.48 | 20.47 | 25.29 | 18.037 |
| 2019-01-09 | 18.997 | 19.98 | 24.76 | 18.512 |
| 2019-01-10 | 18.688 | 19.5 | 26.46 | 17.855 |
| 2019-01-11 | 17.418 | 18.19 | 25.13 | 17.855 |
| 2019-01-12 | 17.418 | 18.19 | 25.13 | 17.855 |
| 2019-01-13 | 17.418 | 18.19 | 25.13 | 19.972 |
| 2019-01-14 | 17.899 | 19.07 | 25.13 | 19.594 |
| 2019-01-15 | 16.933 | 18.6 | 23.66 | 18.442 |
| 2019-01-16 | 15.718 | 19.04 | 23.16 | 18.119 |
| 2019-01-17 | 15.406 | 18.06 | 22.77 | 16.318 |
| 2019-01-18 | 14.28 | 17.8 | 21.49 | 16.318 |
| 2019-01-19 | 14.28 | 17.8 | 21.49 | 16.318 |
| 2019-01-20 | 14.28 | 17.8 | 21.49 | 15.484 |
| 2019-01-21 | 15.385 | 17.8 | 21.19 | 16.448 |
| 2019-01-22 | 15.997 | 20.8 | 21.29 | 17.833 |
| 2019-01-23 | 16.479 | 19.52 | 21.62 | 14.813 |
| 2019-01-24 | 15.56 | 18.89 | 21.01 | 16.654 |
| 2019-01-25 | 14.782 | 17.42 | 19.8 | 16.654 |
| 2019-01-26 | 14.782 | 17.42 | 19.8 | 16.654 |
| 2019-01-27 | 14.782 | 17.42 | 19.8 | 16.806 |
| 2019-01-28 | 16.155 | 18.87 | 20.36 | 16.205 |
| 2019-01-29 | 16.046 | 19.13 | 20.52 | 16.171 |
| 2019-01-30 | 16.015 | 17.66 | 20.73 | 15.384 |
| 2019-01-31 | 15.113 | 16.57 | 19.24 | 14.95 |
| 2019-02-01 | 13.988 | 16.14 | 18.45 | 14.95 |
| 2019-02-02 | 13.988 | 16.14 | 18.45 | 14.95 |
| 2019-02-03 | 13.988 | 16.14 | 18.45 | 15.43 |
| 2019-02-04 | 14.208 | 15.73 | 17.51 | 15.874 |
| 2019-02-05 | 13.581 | 15.57 | 16.87 | 14.357 |
| 2019-02-06 | 13.616 | 15.38 | 17.67 | 14.804 |
| 2019-02-07 | 16.171 | 16.37 | 17.4 | 15.488 |
| 2019-02-08 | 16.313 | 15.72 | 20.34 | 15.488 |
| 2019-02-09 | 16.313 | 15.72 | 20.34 | 15.488 |
| 2019-02-10 | 16.313 | 15.72 | 20.34 | 15.767 |
| 2019-02-11 | 15.219 | 15.97 | 20.34 | 16.238 |
| 2019-02-12 | 14.281 | 15.43 | 18.2 | 14.795 |
| 2019-02-13 | 13.97 | 15.65 | 18.27 | 14.549 |
| 2019-02-14 | 15.757 | 16.22 | 17.71 | 14.115 |
| 2019-02-15 | 14.294 | 14.91 | 18.74 | 14.115 |
| 2019-02-16 | 14.294 | 14.91 | 18.74 | 14.115 |
| 2019-02-17 | 14.294 | 14.91 | 18.74 | 12.681 |
| 2019-02-18 | 14.538 | 14.91 | 17.93 | 12.376 |
| 2019-02-19 | 14.614 | 14.88 | 18.39 | 12.859 |
| 2019-02-20 | 14.274 | 14.02 | 18.15 | 10.367 |
| 2019-02-21 | 14.344 | 14.46 | 17.32 | 12.679 |
| 2019-02-22 | 13.977 | 13.51 | 17.07 | 12.679 |
| 2019-02-23 | 13.977 | 13.51 | 17.07 | 12.679 |
| 2019-02-24 | 13.977 | 13.51 | 17.07 | 12.573 |
| 2019-02-25 | 13.846 | 14.85 | 17.02 | 11.649 |
| 2019-02-26 | 13.894 | 15.17 | 16.65 | 12.587 |
| 2019-02-27 | 14.35 | 14.7 | 16.69 | 13.398 |
| 2019-02-28 | 13.588 | 14.78 | 16.71 | 13.007 |
| 2019-03-01 | 13.371 | 13.57 | 17.09 | 13.007 |
| 2019-03-02 | 13.371 | 13.57 | 17.09 | 13.007 |
| 2019-03-03 | 13.371 | 13.57 | 17.09 | 12.117 |
| 2019-03-04 | 13.65 | 14.63 | 16.82 | 11.959 |
| 2019-03-05 | 13.508 | 14.74 | 16.98 | 12.943 |
| 2019-03-06 | 13.441 | 15.74 | 17.77 | 13.271 |
| 2019-03-07 | 13.867 | 16.59 | 18.39 | 14.84 |
| 2019-03-08 | 14.411 | 16.05 | 19.85 | 14.84 |
| 2019-03-09 | 14.411 | 16.05 | 19.85 | 14.84 |
| 2019-03-10 | 14.411 | 16.05 | 19.85 | 15.553 |
| 2019-03-11 | 14.155 | 14.33 | 18.75 | 14.458 |
| 2019-03-12 | 13.836 | 13.77 | 17.19 | 14.692 |
| 2019-03-13 | 13.95 | 13.41 | 17.72 | 12.936 |
| 2019-03-14 | 13.648 | 13.5 | 16.96 | 13.093 |
| 2019-03-15 | 12.924 | 12.88 | 16.01 | 13.093 |
| 2019-03-16 | 12.924 | 12.88 | 16.01 | 13.093 |
| 2019-03-17 | 12.924 | 12.88 | 16.01 | 12.668 |
| 2019-03-18 | 13.212 | 13.1 | 15.85 | 12.796 |
| 2019-03-19 | 13.001 | 13.56 | 15.68 | 12.514 |
| 2019-03-20 | 14.478 | 13.91 | 15.74 | 12.126 |
| 2019-03-21 | 15.688 | 13.63 | 15.74 | 12.126 |
| 2019-03-22 | 17.678 | 16.48 | 15.36 | 12.126 |
| 2019-03-23 | 17.678 | 16.48 | 15.36 | 12.126 |
| 2019-03-24 | 17.678 | 16.48 | 15.36 | 14.015 |
| 2019-03-25 | 17.336 | 16.33 | 15.36 | 16.105 |
| 2019-03-26 | 15.846 | 14.68 | 15.36 | 13.035 |
| 2019-03-27 | 16.334 | 15.15 | 15.36 | 12.718 |
| 2019-03-28 | 16.672 | 14.43 | 15.36 | 14.626 |
| 2019-03-29 | 15.275 | 13.71 | 15.36 | 14.626 |
| 2019-03-30 | 15.275 | 13.71 | 15.36 | 14.626 |
| 2019-03-31 | 15.275 | 13.71 | 15.36 | 13.543 |
| 2019-04-01 | 14.79 | 13.4 | 15.36 | 12.852 |
| 2019-04-02 | 14.785 | 13.36 | 15.36 | 12.363 |
| 2019-04-03 | 14.192 | 13.74 | 15.36 | 12.702 |
| 2019-04-04 | 14.247 | 13.58 | 15.36 | 13.301 |
| 2019-04-05 | 13.552 | 12.82 | 15.36 | 13.301 |
| 2019-04-06 | 13.552 | 12.82 | 15.36 | 13.301 |
| 2019-04-07 | 13.552 | 12.82 | 15.36 | 13.444 |
| 2019-04-08 | 14.603 | 13.18 | 15.36 | 13.484 |
| 2019-04-09 | 14.519 | 14.28 | 15.36 | 13.484 |
| 2019-04-10 | 14.281 | 13.3 | 15.36 | 12.859 |
| 2019-04-11 | 12.595 | 13.02 | 15.36 | 11.979 |
| 2019-04-12 | 11.877 | 12.01 | 15.36 | 11.979 |
| 2019-04-13 | 11.877 | 12.01 | 15.36 | 11.979 |
| 2019-04-14 | 11.877 | 12.01 | 15.36 | 12.773 |
| 2019-04-15 | 11.486 | 12.32 | 15.36 | 12.72 |
| 2019-04-16 | 11.301 | 12.18 | 15.36 | 11 |
| 2019-04-17 | 11.267 | 12.6 | 15.36 | 10.75 |
| 2019-04-18 | 11.007 | 12.09 | 15.36 | 11.07 |
| 2019-04-19 | 11.007 | 12.09 | 15.36 | 11.07 |
| 2019-04-20 | 11.007 | 12.09 | 15.36 | 11.07 |
| 2019-04-21 | 11.007 | 12.09 | 15.36 | 10.29 |
| 2019-04-22 | 11.007 | 12.42 | 15.36 | 9.45 |
| 2019-04-23 | 12.204 | 12.28 | 15.36 | 9.97 |
| 2019-04-24 | 12.545 | 13.14 | 15.36 | 11.31 |
| 2019-04-25 | 12.957 | 13.25 | 15.36 | 11.31 |
| 2019-04-26 | 12.603 | 12.73 | 15.36 | 11.31 |
| 2019-04-27 | 12.603 | 12.73 | 15.36 | 11.31 |
| 2019-04-28 | 12.603 | 12.73 | 15.36 | 10.62 |
| 2019-04-29 | 13.028 | 13.11 | 15.36 | 10.98 |
| 2019-04-30 | 13.262 | 13.12 | 15.36 | 12.07 |
| 2019-05-01 | 13.262 | 14.8 | 15.36 | 12.49 |
| 2019-05-02 | 14.336 | 14.42 | 15.36 | 12.68 |
| 2019-05-03 | 13.381 | 12.87 | 15.36 | 12.68 |
| 2019-05-04 | 13.381 | 12.87 | 15.36 | 12.68 |
| 2019-05-05 | 13.381 | 12.87 | 15.36 | 13.33 |
| 2019-05-06 | 15.738 | 15.44 | 15.36 | 14.08 |
| 2019-05-07 | 18.043 | 19.32 | 19.39 | 13.88 |
| 2019-05-08 | 17.643 | 19.4 | 20.76 | 13.88 |
| 2019-05-09 | 20.038 | 19.1 | 23.46 | 13.88 |
| 2019-05-10 | 18.507 | 16.04 | 23.74 | 13.88 |
| 2019-05-11 | 18.507 | 16.04 | 23.74 | 13.88 |
| 2019-05-12 | 18.507 | 16.04 | 23.74 | 14.73 |
| 2019-05-13 | 19.426 | 20.55 | 22.38 | 16.83 |
| 2019-05-14 | 17.561 | 18.06 | 21.91 | 15.82 |
| 2019-05-15 | 16.747 | 16.44 | 18.94 | 16.21 |
| 2019-05-16 | 15.06 | 15.29 | 19.37 | 13.84 |
| 2019-05-17 | 14.977 | 15.96 | 18.51 | 13.84 |
| 2019-05-18 | 14.977 | 15.96 | 18.51 | 13.84 |
| 2019-05-19 | 14.977 | 15.96 | 18.51 | 14.61 |
| 2019-05-20 | 17.381 | 16.31 | 18.51 | 16.23 |
| 2019-05-21 | 15.83 | 14.95 | 18.51 | 14.48 |
| 2019-05-22 | 15.449 | 14.75 | 18.51 | 12.51 |
| 2019-05-23 | 17.637 | 16.92 | 18.51 | 12.92 |
| 2019-05-24 | 16.715 | 15.85 | 18.51 | 12.92 |
| 2019-05-25 | 16.715 | 15.85 | 18.51 | 12.92 |
| 2019-05-26 | 16.715 | 15.85 | 18.51 | 11.98 |
| 2019-05-27 | 16.237 | 15.85 | 18.51 | 12.72 |
| 2019-05-28 | 16.166 | 17.5 | 18.51 | 14.35 |
| 2019-05-29 | 17.781 | 17.9 | 18.51 | 15.42 |
| 2019-05-30 | 16.761 | 17.3 | 18.51 | 14.67 |
| 2019-05-31 | 17.422 | 18.71 | 18.51 | 14.67 |
| 2019-06-01 | 17.422 | 18.71 | 18.51 | 14.67 |
| 2019-06-02 | 17.422 | 18.71 | 18.51 | 15.39 |
| 2019-06-03 | 17.242 | 18.86 | 18.51 | 14.99 |
| 2019-06-04 | 16.42 | 16.97 | 18.51 | 14.37 |
| 2019-06-05 | 16.103 | 16.09 | 18.51 | 13.79 |
| 2019-06-06 | 15.63 | 15.93 | 18.51 | 13.93 |
| 2019-06-07 | 14.908 | 16.3 | 18.51 | 13.93 |
| 2019-06-08 | 14.908 | 16.3 | 18.51 | 13.93 |
| 2019-06-09 | 14.908 | 16.3 | 18.51 | 13.93 |
| 2019-06-10 | 14.891 | 15.94 | 18.51 | 13.93 |
| 2019-06-11 | 14.796 | 15.99 | 18.51 | 13.42 |
| 2019-06-12 | 14.945 | 15.91 | 18.51 | 14.35 |
| 2019-06-13 | 14.366 | 15.82 | 18.51 | 12.76 |
| 2019-06-14 | 14.363 | 15.28 | 18.51 | 12.76 |
| 2019-06-15 | 14.363 | 15.28 | 18.51 | 12.76 |
| 2019-06-16 | 14.363 | 15.28 | 18.51 | 14.34 |
| 2019-06-17 | 14.029 | 15.35 | 18.51 | 14.44 |
| 2019-06-18 | 13.27 | 15.15 | 18.51 | 12.91 |
| 2019-06-19 | 13.66 | 14.33 | 16.24 | 12.48 |
| 2019-06-20 | 13.347 | 14.75 | 15.24 | 10.13 |
| 2019-06-21 | 13.389 | 15.4 | 16 | 10.13 |
| 2019-06-22 | 13.389 | 15.4 | 16 | 10.13 |
| 2019-06-23 | 13.389 | 15.4 | 16 | 11.49 |
| 2019-06-24 | 13.967 | 15.26 | 16.06 | 11.04 |
| 2019-06-25 | 13.982 | 16.28 | 16.4 | 12.18 |
| 2019-06-26 | 14.063 | 16.21 | 16.55 | 11.02 |
| 2019-06-27 | 14.117 | 15.82 | 16.32 | 12.12 |
| 2019-06-28 | 13.734 | 15.08 | 16.8 | 12.12 |
| 2019-06-29 | 13.734 | 15.08 | 16.8 | 12.12 |
| 2019-06-30 | 13.734 | 15.08 | 16.8 | 11.11 |
| 2019-07-01 | 12.383 | 14.06 | 16.8 | 11.11 |
| 2019-07-02 | 11.837 | 12.93 | 16.8 | 11.11 |
| 2019-07-03 | 11.704 | 12.57 | 16.8 | 10.76 |
| 2019-07-04 | 11.765 | 12.57 | 16.8 | 10.76 |
| 2019-07-05 | 12.418 | 13.28 | 16.8 | 10.76 |
| 2019-07-06 | 12.418 | 13.28 | 16.8 | 10.76 |
| 2019-07-07 | 12.418 | 13.28 | 16.8 | 11.46 |
| 2019-07-08 | 12.616 | 13.96 | 16.8 | 11.32 |
| 2019-07-09 | 12.75 | 14.09 | 16.8 | 11.5 |
| 2019-07-10 | 12.819 | 13.03 | 16.8 | 11.09 |
| 2019-07-11 | 12.475 | 12.93 | 16.8 | 11.03 |
| 2019-07-12 | 12.389 | 12.39 | 16.8 | 11.03 |
| 2019-07-13 | 12.389 | 12.39 | 16.8 | 11.03 |
| 2019-07-14 | 12.389 | 12.39 | 16.8 | 10.62 |
| 2019-07-15 | 12.606 | 12.68 | 16.8 | 10.62 |
| 2019-07-16 | 12.159 | 12.86 | 16.8 | 11.86 |
| 2019-07-17 | 12.603 | 13.97 | 16.8 | 14.16 |
| 2019-07-18 | 13.332 | 13.53 | 16.8 | 14.08 |
| 2019-07-19 | 13.697 | 14.45 | 16.8 | 14.08 |
| 2019-07-20 | 13.697 | 14.45 | 16.8 | 14.08 |
| 2019-07-21 | 13.697 | 14.45 | 16.8 | 14.76 |
| 2019-07-22 | 13.55 | 13.53 | 16.8 | 12.39 |
| 2019-07-23 | 12.714 | 12.61 | 16.8 | 10.99 |
| 2019-07-24 | 13.123 | 12.07 | 14.92 | 9.97 |
| 2019-07-25 | 13.267 | 12.74 | 15.16 | 11.34 |
| 2019-07-26 | 12.669 | 12.16 | 15.35 | 11.34 |
| 2019-07-27 | 12.669 | 12.16 | 15.35 | 11.34 |
| 2019-07-28 | 12.669 | 12.16 | 15.35 | 12.29 |
| 2019-07-29 | 12.639 | 12.83 | 15.58 | 13.18 |
| 2019-07-30 | 14.466 | 13.94 | 15.08 | 13.11 |
| 2019-07-31 | 14.391 | 16.12 | 15.71 | 12.3 |
| 2019-08-01 | 13.735 | 17.87 | 15.71 | 11.81 |
| 2019-08-02 | 18.348 | 17.61 | 15.71 | 11.81 |
| 2019-08-03 | 18.348 | 17.61 | 15.71 | 11.81 |
| 2019-08-04 | 18.348 | 17.61 | 15.71 | 13.11 |
| 2019-08-05 | 21.062 | 24.59 | 15.71 | 15.37 |
| 2019-08-06 | 21.378 | 20.17 | 15.71 | 15.36 |
| 2019-08-07 | 21.039 | 19.49 | 22.4 | 16.42 |
| 2019-08-08 | 18.004 | 16.91 | 21.07 | 14.8 |
| 2019-08-09 | 18.953 | 17.97 | 19.76 | 14.8 |
| 2019-08-10 | 18.953 | 17.97 | 19.76 | 14.8 |
| 2019-08-11 | 18.953 | 17.97 | 19.76 | 14.8 |
| 2019-08-12 | 19.254 | 21.09 | 19.76 | 15.83 |
| 2019-08-13 | 18.622 | 17.52 | 21.37 | 15.83 |
| 2019-08-14 | 22.062 | 22.1 | 19.12 | 18.84 |
| 2019-08-15 | 22.542 | 21.18 | 21.37 | 19.69 |
| 2019-08-16 | 20.384 | 18.47 | 21.51 | 19.69 |
| 2019-08-17 | 20.384 | 18.47 | 21.51 | 19.69 |
| 2019-08-18 | 20.384 | 18.47 | 21.51 | 19.69 |
| 2019-08-19 | 18.256 | 16.88 | 20.43 | 16.73 |
| 2019-08-20 | 18.429 | 17.5 | 18.19 | 16.51 |
| 2019-08-21 | 16.772 | 15.8 | 18.39 | 15.96 |
| 2019-08-22 | 18.233 | 16.68 | 17.52 | 15.06 |
| 2019-08-23 | 20.147 | 19.87 | 17.25 | 15.06 |
| 2019-08-24 | 20.147 | 19.87 | 17.25 | 15.06 |
| 2019-08-25 | 20.147 | 19.87 | 17.25 | 20.51 |
| 2019-08-26 | 20.25 | 19.32 | 20.98 | 16.96 |
| 2019-08-27 | 19.44 | 20.31 | 19.45 | 16.04 |
| 2019-08-28 | 19.327 | 19.35 | 18.96 | 14.15 |
| 2019-08-29 | 17.601 | 17.88 | 19.34 | 14.91 |
| 2019-08-30 | 17.668 | 18.98 | 17.98 | 14.91 |
| 2019-08-31 | 17.668 | 18.98 | 17.98 | 14.91 |
| 2019-09-01 | 17.668 | 18.98 | 17.98 | 15.56 |
| 2019-09-02 | 17.538 | 18.98 | 18.32 | 15.28 |
| 2019-09-03 | 18.24 | 19.66 | 17.95 | 15.79 |
| 2019-09-04 | 16.579 | 17.33 | 17.34 | 14.71 |
| 2019-09-05 | 15.505 | 16.27 | 16.21 | 15 |
| 2019-09-06 | 14.631 | 15 | 16.02 | 15 |
| 2019-09-07 | 14.631 | 15 | 16.02 | 15 |
| 2019-09-08 | 14.631 | 15 | 16.02 | 14.42 |
| 2019-09-09 | 14.942 | 15.27 | 15.4 | 13.74 |
| 2019-09-10 | 15.257 | 15.2 | 15.41 | 13.81 |
| 2019-09-11 | 15.435 | 14.61 | 16.23 | 12.6 |
| 2019-09-12 | 14.414 | 14.22 | 16.22 | 11.91 |
| 2019-09-13 | 13.736 | 13.74 | 16.38 | 11.91 |
| 2019-09-14 | 13.736 | 13.74 | 16.38 | 11.91 |
| 2019-09-15 | 13.736 | 13.74 | 16.38 | 13.35 |
| 2019-09-16 | 15.247 | 14.67 | 16.38 | 13.37 |
| 2019-09-17 | 15.55 | 14.44 | 16.47 | 13.37 |
| 2019-09-18 | 15.21 | 13.95 | 16.87 | 12.3 |
| 2019-09-19 | 14.501 | 14.05 | 16.44 | 11.26 |
| 2019-09-20 | 13.974 | 15.32 | 15.99 | 11.26 |
| 2019-09-21 | 13.974 | 15.32 | 15.99 | 11.26 |
| 2019-09-22 | 13.974 | 15.32 | 15.99 | 11.58 |
| 2019-09-23 | 15.578 | 14.91 | 15.99 | 12.17 |
| 2019-09-24 | 15.972 | 17.05 | 16.7 | 12.1 |
| 2019-09-25 | 17.231 | 15.96 | 17.8 | 10.96 |
| 2019-09-26 | 16.587 | 16.07 | 17.24 | 11.26 |
| 2019-09-27 | 15.883 | 17.22 | 16.87 | 11.26 |
| 2019-09-28 | 15.883 | 17.22 | 16.87 | 11.26 |
| 2019-09-29 | 15.883 | 17.22 | 16.87 | 11.26 |
| 2019-09-30 | 15.828 | 16.24 | 17.41 | 11.26 |
| 2019-10-01 | 17.26 | 18.56 | 15.92 | 11.26 |
| 2019-10-02 | 21.007 | 20.56 | 16.98 | 13.6 |
| 2019-10-03 | 20.501 | 19.12 | 19.21 | 14.22 |
| 2019-10-04 | 18.524 | 17.04 | 18.23 | 14.22 |
| 2019-10-05 | 18.524 | 17.04 | 18.23 | 14.22 |
| 2019-10-06 | 18.524 | 17.04 | 18.23 | 12.11 |
| 2019-10-07 | 17.856 | 17.86 | 18.21 | 12.26 |
| 2019-10-08 | 19.229 | 20.28 | 17.01 | 12.26 |
| 2019-10-09 | 18.392 | 18.64 | 18.09 | 12.26 |
| 2019-10-10 | 17.418 | 17.57 | 17.79 | 12.89 |
| 2019-10-11 | 15.891 | 15.58 | 17.37 | 12.89 |
| 2019-10-12 | 15.891 | 15.58 | 17.37 | 12.89 |
| 2019-10-13 | 15.891 | 15.58 | 17.37 | 12.89 |
| 2019-10-14 | 15.917 | 14.57 | 17.37 | 12.89 |
| 2019-10-15 | 14.472 | 13.54 | 15.66 | 11.59 |
| 2019-10-16 | 14.76 | 13.68 | 15.64 | 10.42 |
| 2019-10-17 | 14.928 | 13.79 | 15.37 | 9.26 |
| 2019-10-18 | 15.375 | 14.25 | 15.55 | 9.26 |
| 2019-10-19 | 15.375 | 14.25 | 15.55 | 9.26 |
| 2019-10-20 | 15.375 | 14.25 | 15.55 | 9.26 |
| 2019-10-21 | 14.744 | 14 | 15.53 | 9.26 |
| 2019-10-22 | 14.174 | 14.46 | 15.53 | 9.88 |
| 2019-10-23 | 13.456 | 14.01 | 15.37 | 12.61 |
| 2019-10-24 | 13.092 | 13.71 | 15.06 | 11.26 |
| 2019-10-25 | 12.821 | 12.65 | 14.68 | 11.26 |
| 2019-10-26 | 12.821 | 12.65 | 14.68 | 11.26 |
| 2019-10-27 | 12.821 | 12.65 | 14.68 | 11.03 |
| 2019-10-28 | 13.201 | 13.11 | 14.83 | 11.2 |
| 2019-10-29 | 13.726 | 13.2 | 14.66 | 11.06 |
| 2019-10-30 | 13.796 | 12.33 | 15.39 | 11.9 |
| 2019-10-31 | 13.792 | 13.22 | 14.17 | 11.04 |
| 2019-11-01 | 12.844 | 12.3 | 14.23 | 11.04 |
| 2019-11-02 | 12.844 | 12.3 | 14.23 | 11.04 |
| 2019-11-03 | 12.844 | 12.3 | 14.23 | 10.31 |
| 2019-11-04 | 12.905 | 12.83 | 14.23 | 10.57 |
| 2019-11-05 | 12.923 | 13.1 | 14.46 | 10.64 |
| 2019-11-06 | 12.934 | 12.62 | 15.04 | 10.89 |
| 2019-11-07 | 12.754 | 12.73 | 14.26 | 10.23 |
| 2019-11-08 | 12.851 | 12.07 | 14.54 | 10.23 |
| 2019-11-09 | 12.851 | 12.07 | 14.54 | 10.23 |
| 2019-11-10 | 12.851 | 12.07 | 14.54 | 10.37 |
| 2019-11-11 | 13.089 | 12.69 | 14.55 | 11.12 |
| 2019-11-12 | 12.634 | 12.68 | 14.07 | 11.2 |
| 2019-11-13 | 12.796 | 13 | 15.3 | 10.68 |
| 2019-11-14 | 12.474 | 13.05 | 15.77 | 9.82 |
| 2019-11-15 | 11.537 | 12.05 | 14.76 | 9.82 |
| 2019-11-16 | 11.537 | 12.05 | 14.76 | 9.82 |
| 2019-11-17 | 11.537 | 12.05 | 14.76 | 10.33 |
| 2019-11-18 | 12.037 | 12.46 | 14.31 | 11.06 |
| 2019-11-19 | 12.37 | 12.86 | 14.39 | 11.2 |
| 2019-11-20 | 12.727 | 12.78 | 15.04 | 11.04 |
| 2019-11-21 | 13.132 | 13.13 | 15.52 | 11.02 |
| 2019-11-22 | 13.089 | 12.34 | 15.14 | 11.02 |
| 2019-11-23 | 13.089 | 12.34 | 15.14 | 11.02 |
| 2019-11-24 | 13.089 | 12.34 | 15.14 | 11.6 |
| 2019-11-25 | 12.384 | 11.87 | 14.74 | 11.17 |
| 2019-11-26 | 12.095 | 11.54 | 14.37 | 11.17 |
| 2019-11-27 | 12.203 | 11.75 | 13.96 | 11.17 |
| 2019-11-28 | 12.796 | 11.75 | 14.11 | 9.64 |
| 2019-11-29 | 13.174 | 12.62 | 14.31 | 9.64 |
| 2019-11-30 | 13.174 | 12.62 | 14.31 | 9.64 |
| 2019-12-01 | 13.174 | 12.62 | 14.31 | 10.46 |
| 2019-12-02 | 15.889 | 14.91 | 13.81 | 10.53 |
| 2019-12-03 | 16.91 | 15.96 | 14.75 | 11.99 |
| 2019-12-04 | 15.224 | 14.8 | 16.39 | 10.62 |
| 2019-12-05 | 15.371 | 14.52 | 15.45 | 10.36 |
| 2019-12-06 | 14.133 | 13.62 | 15.33 | 10.36 |
| 2019-12-07 | 14.133 | 13.62 | 15.33 | 10.36 |
| 2019-12-08 | 14.133 | 13.62 | 15.33 | 9.82 |
| 2019-12-09 | 14.925 | 15.86 | 15.64 | 9.68 |
| 2019-12-10 | 15.022 | 15.68 | 15.95 | 9.65 |
| 2019-12-11 | 15.234 | 14.99 | 16.16 | 9.78 |
| 2019-12-12 | 14.663 | 13.94 | 15.89 | 9.48 |
| 2019-12-13 | 13.117 | 12.63 | 14.8 | 9.48 |
| 2019-12-14 | 13.117 | 12.63 | 14.8 | 9.48 |
| 2019-12-15 | 13.117 | 12.63 | 14.8 | 9.34 |
| 2019-12-16 | 11.644 | 12.14 | 13.62 | 9.68 |
| 2019-12-17 | 12.149 | 12.29 | 12.91 | 8.96 |
| 2019-12-18 | 11.824 | 12.58 | 13.46 | 8.95 |
| 2019-12-19 | 12.176 | 12.5 | 13.17 | 9.22 |
| 2019-12-20 | 11.077 | 12.51 | 13.48 | 9.22 |
| 2019-12-21 | 11.077 | 12.51 | 13.48 | 9.22 |
| 2019-12-22 | 11.077 | 12.51 | 13.48 | 9.65 |
| 2019-12-23 | 11.648 | 12.61 | 13.8 | 11.12 |
| 2019-12-24 | 11.648 | 12.67 | 13.88 | 10.73 |
| 2019-12-25 | 11.648 | 12.67 | 13.74 | 10.69 |
| 2019-12-26 | 11.648 | 12.65 | 13.66 | 10.36 |
| 2019-12-27 | 12.091 | 13.43 | 13.66 | 10.36 |
| 2019-12-28 | 12.091 | 13.43 | 13.66 | 10.36 |
| 2019-12-29 | 12.091 | 13.43 | 13.66 | 11.32 |
| 2019-12-30 | 13.955 | 14.82 | 13.66 | 11.98 |
| 2019-12-31 | 13.955 | 13.78 | 13.66 | 11.98 |
| 2020-01-01 | 13.955 | 13.78 | 13.66 | 11.27 |
| 2020-01-02 | 12.674 | 12.47 | 13.66 | 11.38 |
| 2020-01-03 | 13.959 | 14.02 | 13.66 | 11.38 |
| 2020-01-04 | 13.959 | 14.02 | 13.66 | 11.38 |
| 2020-01-05 | 13.959 | 14.02 | 13.66 | 12.33 |
| 2020-01-06 | 15.14 | 13.85 | 16.88 | 12.28 |
| 2020-01-07 | 14.212 | 13.79 | 15.04 | 12.46 |
| 2020-01-08 | 14.04 | 13.45 | 17.28 | 12.01 |
| 2020-01-09 | 13.036 | 12.54 | 14.71 | 11.44 |
| 2020-01-10 | 12.389 | 12.56 | 14.44 | 11.44 |
| 2020-01-11 | 12.389 | 12.56 | 14.44 | 11.44 |
| 2020-01-12 | 12.389 | 12.56 | 14.44 | 11.8 |
| 2020-01-13 | 12.714 | 12.32 | 14.44 | 11.77 |
| 2020-01-14 | 12.41 | 12.39 | 14.03 | 10.99 |
| 2020-01-15 | 12.041 | 12.42 | 14.31 | 10.64 |
| 2020-01-16 | 11.022 | 12.32 | 13.91 | 9.91 |
| 2020-01-17 | 10.69 | 12.1 | 13.16 | 9.91 |
| 2020-01-18 | 10.69 | 12.1 | 13.16 | 9.91 |
| 2020-01-19 | 10.69 | 12.1 | 13.16 | 10.37 |
| 2020-01-20 | 11.252 | 12.1 | 13.43 | 11.28 |
| 2020-01-21 | 11.814 | 12.85 | 14.93 | 10.48 |
| 2020-01-22 | 12.239 | 12.91 | 14.21 | 10.27 |
| 2020-01-23 | 13.164 | 12.98 | 15.54 | 9.93 |
| 2020-01-24 | 12.666 | 14.56 | 14.85 | 9.93 |
| 2020-01-25 | 12.666 | 14.56 | 14.85 | 9.93 |
| 2020-01-26 | 12.666 | 14.56 | 14.85 | 12.78 |
| 2020-01-27 | 17.171 | 18.23 | 19.78 | 14.42 |
| 2020-01-28 | 15.198 | 16.28 | 19.27 | 14.28 |
| 2020-01-29 | 14.42 | 16.39 | 17.52 | 11.45 |
| 2020-01-30 | 16.417 | 15.49 | 19.29 | 13.61 |
| 2020-01-31 | 17.154 | 18.84 | 18.56 | 13.61 |
| 2020-02-01 | 17.154 | 18.84 | 18.56 | 13.61 |
| 2020-02-02 | 17.154 | 18.84 | 18.56 | 19.97 |
| 2020-02-03 | 16.284 | 17.97 | 19.98 | 17.55 |
| 2020-02-04 | 14.497 | 16.05 | 18.4 | 14.28 |
| 2020-02-05 | 13.605 | 15.15 | 17.32 | 14.47 |
| 2020-02-06 | 12.989 | 14.96 | 17.64 | 14.18 |
| 2020-02-07 | 13.324 | 15.47 | 17.45 | 14.18 |
| 2020-02-08 | 13.324 | 15.47 | 17.45 | 14.18 |
| 2020-02-09 | 13.324 | 15.47 | 17.45 | 17.78 |
| 2020-02-10 | 13.703 | 15.04 | 17.98 | 15.52 |
| 2020-02-11 | 12.92 | 15.18 | 17.98 | 14.63 |
| 2020-02-12 | 12.453 | 13.74 | 16.24 | 13.54 |
| 2020-02-13 | 13.248 | 14.15 | 16.09 | 15.67 |
| 2020-02-14 | 13.062 | 13.68 | 16.55 | 15.67 |
| 2020-02-15 | 13.062 | 13.68 | 16.55 | 15.67 |
| 2020-02-16 | 13.062 | 13.68 | 16.55 | 15.67 |
| 2020-02-17 | 12.965 | 13.68 | 15.88 | 15.81 |
| 2020-02-18 | 13.843 | 14.83 | 17.47 | 15.81 |
| 2020-02-19 | 12.883 | 14.38 | 16.93 | 14.67 |
| 2020-02-20 | 14.09 | 15.56 | 16.93 | 13.29 |
| 2020-02-21 | 15.754 | 17.08 | 19 | 13.29 |
| 2020-02-22 | 15.754 | 17.08 | 19 | 13.29 |
| 2020-02-23 | 15.754 | 17.08 | 19 | 19.78 |
| 2020-02-24 | 22.658 | 25.03 | 19 | 25.51 |
| 2020-02-25 | 27.445 | 27.85 | 24.49 | 20.96 |
| 2020-02-26 | 24.54 | 27.56 | 27.72 | 17.58 |
| 2020-02-27 | 34.699 | 39.16 | 31.79 | 26.11 |
| 2020-02-28 | 42.237 | 40.11 | 46.01 | 26.11 |
| 2020-02-29 | 42.237 | 40.11 | 46.01 | 26.11 |
| 2020-03-01 | 42.237 | 40.11 | 46.01 | 31.04 |
| 2020-03-02 | 36.119 | 33.42 | 42.34 | 31.04 |
| 2020-03-03 | 33.453 | 36.82 | 41.81 | 26.76 |
| 2020-03-04 | 29.756 | 31.99 | 35.01 | 26.76 |
| 2020-03-05 | 33.14 | 39.62 | 29.01 | 25.65 |
| 2020-03-06 | 43.021 | 41.94 | 41.49 | 25.65 |
| 2020-03-07 | 43.021 | 41.94 | 41.49 | 25.65 |
| 2020-03-08 | 43.021 | 41.94 | 41.49 | 38.57 |
| 2020-03-09 | 54.099 | 54.46 | 57.12 | 59.29 |
| 2020-03-10 | 53.803 | 47.3 | 50.57 | 59.29 |
| 2020-03-11 | 53.762 | 53.9 | 53.88 | 65.23 |
| 2020-03-12 | 71.52 | 75.47 | 62.63 | 84.03 |
| 2020-03-13 | 74.332 | 57.83 | 73.57 | 84.03 |
| 2020-03-14 | 74.332 | 57.83 | 73.57 | 84.03 |
| 2020-03-15 | 74.332 | 57.83 | 73.57 | 75.65 |
| 2020-03-16 | 85.621 | 82.69 | 73.57 | 71.27 |
| 2020-03-17 | 77.262 | 75.91 | 73.57 | 72.31 |
| 2020-03-18 | 84.797 | 76.45 | 73.57 | 66.16 |
| 2020-03-19 | 78.346 | 72 | 73.57 | 64.47 |
| 2020-03-20 | 68.215 | 66.04 | 73.57 | 64.47 |
| 2020-03-21 | 68.215 | 66.04 | 73.57 | 64.47 |
| 2020-03-22 | 68.215 | 66.04 | 73.57 | 71.14 |
| 2020-03-23 | 64.428 | 61.59 | 70.02 | 57.8 |
| 2020-03-24 | 52.53 | 61.67 | 53.49 | 49.29 |
| 2020-03-25 | 57.13 | 63.95 | 53.37 | 40.1 |
| 2020-03-26 | 54.315 | 61 | 62.95 | 45.16 |
| 2020-03-27 | 60.995 | 65.54 | 60.38 | 45.16 |
| 2020-03-28 | 60.995 | 65.54 | 60.38 | 45.16 |
| 2020-03-29 | 60.995 | 65.54 | 60.38 | 50.48 |
| 2020-03-30 | 55.632 | 57.08 | 64.16 | 44.82 |
| 2020-03-31 | 48.593 | 53.54 | 56.69 | 39.76 |
| 2020-04-01 | 51.141 | 57.06 | 61.27 | 44.61 |
| 2020-04-02 | 49.916 | 50.91 | 54.04 | 43.62 |
| 2020-04-03 | 45.881 | 46.8 | 54.32 | 43.62 |
| 2020-04-04 | 45.881 | 46.8 | 54.32 | 43.62 |
| 2020-04-05 | 45.881 | 46.8 | 54.32 | 39.83 |
| 2020-04-06 | 43.03 | 45.24 | 54.32 | 33.48 |
| 2020-04-07 | 46.287 | 46.7 | 54.32 | 30.66 |
| 2020-04-08 | 45.297 | 43.35 | 54.32 | 30.66 |
| 2020-04-09 | 44.711 | 41.67 | 54.32 | 30.66 |
| 2020-04-10 | 44.711 | 41.67 | 54.32 | 30.66 |
| 2020-04-11 | 44.711 | 41.67 | 54.32 | 30.66 |
| 2020-04-12 | 44.711 | 41.67 | 54.32 | 34.45 |
| 2020-04-13 | 44.711 | 41.17 | 43.4 | 32.99 |
| 2020-04-14 | 40.477 | 37.76 | 38.52 | 32.99 |
| 2020-04-15 | 44.958 | 40.84 | 37.46 | 32.99 |
| 2020-04-16 | 43.262 | 40.11 | 40.12 | 32.94 |
| 2020-04-17 | 41.201 | 38.15 | 38.25 | 32.94 |
| 2020-04-18 | 41.201 | 38.15 | 38.25 | 32.94 |
| 2020-04-19 | 41.201 | 38.15 | 38.25 | 30.49 |
| 2020-04-20 | 41.298 | 43.83 | 38.49 | 30.98 |
| 2020-04-21 | 48.222 | 45.41 | 41.83 | 33.11 |
| 2020-04-22 | 43.957 | 41.98 | 42.99 | 27.87 |
| 2020-04-23 | 40.353 | 41.38 | 38.58 | 28.28 |
| 2020-04-24 | 40.174 | 35.93 | 39.45 | 28.28 |
| 2020-04-25 | 40.174 | 35.93 | 39.45 | 28.28 |
| 2020-04-26 | 40.174 | 35.93 | 39.45 | 24.56 |
| 2020-04-27 | 34.719 | 33.29 | 34.23 | 23.6 |
| 2020-04-28 | 33.012 | 33.57 | 32.16 | 23.6 |
| 2020-04-29 | 30.72 | 31.23 | 32.16 | 23.6 |
| 2020-04-30 | 33.91 | 34.15 | 29.87 | 24.99 |
| 2020-05-01 | 33.91 | 37.19 | 39.95 | 24.99 |
| 2020-05-02 | 33.91 | 37.19 | 39.95 | 24.99 |
| 2020-05-03 | 33.91 | 37.19 | 39.95 | 30.08 |
| 2020-05-04 | 38.322 | 35.97 | 39.95 | 32.78 |
| 2020-05-05 | 34.506 | 33.61 | 39.95 | 29.12 |
| 2020-05-06 | 34.808 | 34.12 | 39.95 | 29.35 |
| 2020-05-07 | 32.431 | 31.44 | 33.91 | 26.82 |
| 2020-05-08 | 29.664 | 27.98 | 28.82 | 26.82 |
| 2020-05-09 | 29.664 | 27.98 | 28.82 | 26.82 |
| 2020-05-10 | 29.664 | 27.98 | 28.82 | 26.05 |
| 2020-05-11 | 29.907 | 27.57 | 26.95 | 25.48 |
| 2020-05-12 | 27.67 | 33.04 | 27.46 | 25.79 |
| 2020-05-13 | 33.42 | 35.28 | 27.64 | 29.6 |
| 2020-05-14 | 36.322 | 32.61 | 34.3 | 35.73 |
| 2020-05-15 | 34.471 | 31.89 | 31.29 | 35.73 |
| 2020-05-16 | 34.471 | 31.89 | 31.29 | 35.73 |
| 2020-05-17 | 34.471 | 31.89 | 31.29 | 30.27 |
| 2020-05-18 | 29.058 | 29.3 | 30.13 | 25.62 |
| 2020-05-19 | 30.17 | 30.53 | 28.37 | 26.28 |
| 2020-05-20 | 29.109 | 27.99 | 27.73 | 25.64 |
| 2020-05-21 | 32.315 | 29.53 | 27.14 | 25.17 |
| 2020-05-22 | 31.416 | 28.16 | 29.85 | 25.17 |
| 2020-05-23 | 31.416 | 28.16 | 29.85 | 25.17 |
| 2020-05-24 | 31.416 | 28.16 | 29.85 | 18.75 |
| 2020-05-25 | 29.156 | 28.16 | 28.12 | 17.29 |
| 2020-05-26 | 28.038 | 28.01 | 26.32 | 18.87 |
| 2020-05-27 | 29.399 | 27.62 | 27.6 | 24.39 |
| 2020-05-28 | 29.006 | 28.59 | 27.45 | 24.39 |
| 2020-05-29 | 31.126 | 27.51 | 27.91 | 24.39 |
| 2020-05-30 | 31.126 | 27.51 | 27.91 | 24.39 |
| 2020-05-31 | 31.126 | 27.51 | 27.91 | 28.88 |
| 2020-06-01 | 30.099 | 28.23 | 26.52 | 26.21 |
| 2020-06-02 | 30.678 | 26.84 | 27.9 | 25.36 |
| 2020-06-03 | 29.608 | 25.66 | 27.95 | 25.74 |
| 2020-06-04 | 27.662 | 25.81 | 28.19 | 23.73 |
| 2020-06-05 | 27.891 | 24.52 | 26.27 | 23.73 |
| 2020-06-06 | 27.891 | 24.52 | 26.27 | 23.73 |
| 2020-06-07 | 27.891 | 24.52 | 26.27 | 23.73 |
| 2020-06-08 | 28.12 | 25.81 | 26.23 | 21.35 |
| 2020-06-09 | 29.745 | 27.57 | 25.26 | 21.47 |
| 2020-06-10 | 30.052 | 27.57 | 26.31 | 21.84 |
| 2020-06-11 | 36.022 | 40.79 | 29.3 | 24.91 |
| 2020-06-12 | 41.412 | 36.09 | 34.04 | 24.91 |
| 2020-06-13 | 41.412 | 36.09 | 34.04 | 24.91 |
| 2020-06-14 | 41.412 | 36.09 | 34.04 | 28.29 |
| 2020-06-15 | 38.414 | 34.4 | 40.78 | 29.13 |
| 2020-06-16 | 36.098 | 33.67 | 33.75 | 22.79 |
| 2020-06-17 | 35.36 | 33.47 | 32.21 | 23.77 |
| 2020-06-18 | 35.046 | 32.94 | 33.46 | 25.29 |
| 2020-06-19 | 32.214 | 35.12 | 29.98 | 25.29 |
| 2020-06-20 | 32.214 | 35.12 | 29.98 | 25.29 |
| 2020-06-21 | 32.214 | 35.12 | 29.98 | 32.64 |
| 2020-06-22 | 33.781 | 31.77 | 31.6 | 23.45 |
| 2020-06-23 | 31.342 | 31.37 | 28.85 | 22.68 |
| 2020-06-24 | 36.807 | 33.84 | 28.35 | 22.61 |
| 2020-06-25 | 34.684 | 32.22 | 31.06 | 27.94 |
| 2020-06-26 | 35.174 | 34.73 | 28.08 | 27.94 |
| 2020-06-27 | 35.174 | 34.73 | 28.08 | 27.94 |
| 2020-06-28 | 35.174 | 34.73 | 28.08 | 30.99 |
| 2020-06-29 | 34.492 | 31.78 | 32.37 | 29.3 |
| 2020-06-30 | 31.718 | 30.43 | 29.6 | 27.8 |
| 2020-07-01 | 30.13 | 28.62 | 26.8 | 23.67 |
| 2020-07-02 | 27.594 | 27.68 | 25.42 | 20.84 |
| 2020-07-03 | 28.27 | 27.68 | 20.86 | 20.84 |
| 2020-07-04 | 28.27 | 27.68 | 20.86 | 20.84 |
| 2020-07-05 | 28.27 | 27.68 | 20.86 | 26.78 |
| 2020-07-06 | 27.602 | 27.94 | 20.88 | 24.42 |
| 2020-07-07 | 27.934 | 29.43 | 20.68 | 25.46 |
| 2020-07-08 | 29.572 | 28.08 | 21.53 | 27.74 |
| 2020-07-09 | 30.45 | 29.26 | 23.82 | 27.34 |
| 2020-07-10 | 28.428 | 27.29 | 24.7 | 27.34 |
| 2020-07-11 | 28.428 | 27.29 | 24.7 | 27.34 |
| 2020-07-12 | 28.428 | 27.29 | 24.7 | 26.84 |
| 2020-07-13 | 27.135 | 32.19 | 22.23 | 25.39 |
| 2020-07-14 | 28.928 | 29.52 | 22.98 | 27.25 |
| 2020-07-15 | 27.572 | 27.76 | 22.32 | 24.58 |
| 2020-07-16 | 26.807 | 28 | 23.26 | 24.2 |
| 2020-07-17 | 25.576 | 25.68 | 22.59 | 24.2 |
| 2020-07-18 | 25.576 | 25.68 | 22.59 | 24.2 |
| 2020-07-19 | 25.576 | 25.68 | 22.59 | 24.92 |
| 2020-07-20 | 24.211 | 24.46 | 22.2 | 23.41 |
| 2020-07-21 | 23.488 | 24.84 | 20.79 | 21.93 |
| 2020-07-22 | 24.212 | 24.32 | 20.67 | 21.2 |
| 2020-07-23 | 23.314 | 26.08 | 20.67 | 20.55 |
| 2020-07-24 | 25.577 | 25.84 | 20.67 | 20.55 |
| 2020-07-25 | 25.577 | 25.84 | 20.67 | 20.55 |
| 2020-07-26 | 25.577 | 25.84 | 20.67 | 22.92 |
| 2020-07-27 | 25.238 | 24.74 | 22.5 | 18.41 |
| 2020-07-28 | 24.399 | 25.44 | 21.78 | 17.97 |
| 2020-07-29 | 24.232 | 24.1 | 23.87 | 21.78 |
| 2020-07-30 | 28.024 | 24.76 | 22.8 | 21.78 |
| 2020-07-31 | 26.662 | 24.46 | 25.99 | 21.78 |
| 2020-08-01 | 26.662 | 24.46 | 25.99 | 21.78 |
| 2020-08-02 | 26.662 | 24.46 | 25.99 | 22.09 |
| 2020-08-03 | 25.757 | 24.28 | 23.96 | 21.53 |
| 2020-08-04 | 25.087 | 23.76 | 21.41 | 20.6 |
| 2020-08-05 | 23.942 | 22.99 | 21.08 | 18.82 |
| 2020-08-06 | 24.937 | 22.65 | 21.29 | 17.08 |
| 2020-08-07 | 24.198 | 22.21 | 21.37 | 17.08 |
| 2020-08-08 | 24.198 | 22.21 | 21.37 | 17.08 |
| 2020-08-09 | 24.198 | 22.21 | 21.37 | 17.18 |
| 2020-08-10 | 24.113 | 22.13 | 21.37 | 16.64 |
| 2020-08-11 | 23.386 | 24.03 | 21.27 | 15.85 |
| 2020-08-12 | 22.467 | 22.28 | 21.74 | 14.48 |
| 2020-08-13 | 22.691 | 22.13 | 21.69 | 14.96 |
| 2020-08-14 | 23.867 | 22.05 | 21.43 | 14.96 |
| 2020-08-15 | 23.867 | 22.05 | 21.43 | 14.96 |
| 2020-08-16 | 23.867 | 22.05 | 21.43 | 16.32 |
| 2020-08-17 | 22.784 | 21.35 | 21.35 | 15.81 |
| 2020-08-18 | 23.269 | 21.51 | 21.14 | 15.43 |
| 2020-08-19 | 21.988 | 22.54 | 21.21 | 17.14 |
| 2020-08-20 | 24.035 | 22.72 | 22.29 | 17.66 |
| 2020-08-21 | 24.338 | 22.54 | 21.04 | 17.66 |
| 2020-08-22 | 24.338 | 22.54 | 21.04 | 17.66 |
| 2020-08-23 | 24.338 | 22.54 | 21.04 | 19.13 |
| 2020-08-24 | 23.11 | 22.37 | 21.36 | 17.46 |
| 2020-08-25 | 23.359 | 22.03 | 21.2 | 17.07 |
| 2020-08-26 | 22.001 | 23.27 | 21.82 | 17.07 |
| 2020-08-27 | 23.558 | 24.47 | 21.86 | 18.09 |
| 2020-08-28 | 25.158 | 22.96 | 24.96 | 18.09 |
| 2020-08-29 | 25.158 | 22.96 | 24.96 | 18.09 |
| 2020-08-30 | 25.158 | 22.96 | 24.96 | 18.5 |
| 2020-08-31 | 26.721 | 26.41 | 22.34 | 20.9 |
| 2020-09-01 | 27.119 | 26.12 | 22.36 | 19.47 |
| 2020-09-02 | 26.614 | 26.57 | 22.18 | 20.56 |
| 2020-09-03 | 29.012 | 33.6 | 21.7 | 26.73 |
| 2020-09-04 | 31.712 | 30.75 | 23.27 | 26.73 |
| 2020-09-05 | 31.712 | 30.75 | 23.27 | 26.73 |
| 2020-09-06 | 31.712 | 30.75 | 23.27 | 27.04 |
| 2020-09-07 | 27.922 | 30.75 | 23.84 | 25.45 |
| 2020-09-08 | 28.45 | 31.46 | 21.92 | 28.39 |
| 2020-09-09 | 25.889 | 28.81 | 24.22 | 27.6 |
| 2020-09-10 | 25.005 | 29.71 | 22.25 | 27.1 |
| 2020-09-11 | 23.725 | 26.87 | 20.58 | 27.1 |
| 2020-09-12 | 23.725 | 26.87 | 20.58 | 27.1 |
| 2020-09-13 | 23.725 | 26.87 | 20.58 | 24.6 |
| 2020-09-14 | 22.568 | 25.85 | 20.39 | 19.62 |
| 2020-09-15 | 22.116 | 25.59 | 20.6 | 18.71 |
| 2020-09-16 | 21.993 | 26.04 | 20.79 | 18.92 |
| 2020-09-17 | 22.547 | 26.46 | 21.85 | 19 |
| 2020-09-18 | 22.65 | 25.83 | 21.07 | 19 |
| 2020-09-19 | 22.65 | 25.83 | 21.07 | 19 |
| 2020-09-20 | 22.65 | 25.83 | 21.07 | 19 |
| 2020-09-21 | 29.881 | 27.78 | 21.07 | 22.57 |
| 2020-09-22 | 28.11 | 26.86 | 21.07 | 18.25 |
| 2020-09-23 | 27.167 | 28.58 | 22.62 | 17.85 |
| 2020-09-24 | 28.344 | 28.51 | 24.48 | 21.82 |
| 2020-09-25 | 27.808 | 26.38 | 23.77 | 21.82 |
| 2020-09-26 | 27.808 | 26.38 | 23.77 | 21.82 |
| 2020-09-27 | 27.808 | 26.38 | 23.77 | 21.82 |
| 2020-09-28 | 26.824 | 26.19 | 23.51 | 21.82 |
| 2020-09-29 | 26.903 | 26.27 | 22.41 | 21.55 |
| 2020-09-30 | 26.06 | 26.37 | 23.38 | 19.46 |
| 2020-10-01 | 26.537 | 26.7 | 23.12 | 17.2 |
| 2020-10-02 | 26.817 | 27.63 | 23.12 | 17.2 |
| 2020-10-03 | 26.817 | 27.63 | 23.12 | 17.2 |
| 2020-10-04 | 26.817 | 27.63 | 23.12 | 17.72 |
| 2020-10-05 | 26.276 | 27.96 | 23.12 | 16.09 |
| 2020-10-06 | 25.213 | 29.48 | 23.12 | 16.67 |
| 2020-10-07 | 24.974 | 28.06 | 23.12 | 17.3 |
| 2020-10-08 | 23.98 | 26.36 | 23.12 | 16.66 |
| 2020-10-09 | 22.237 | 25 | 23.12 | 16.66 |
| 2020-10-10 | 22.237 | 25 | 23.12 | 16.66 |
| 2020-10-11 | 22.237 | 25 | 23.12 | 16.49 |
| 2020-10-12 | 22.253 | 25.07 | 18.93 | 16.64 |
| 2020-10-13 | 22.94 | 26.07 | 18.76 | 16.44 |
| 2020-10-14 | 23.242 | 26.4 | 19.19 | 15.46 |
| 2020-10-15 | 26.842 | 26.97 | 19.71 | 16.34 |
| 2020-10-16 | 25.316 | 27.41 | 21.33 | 16.34 |
| 2020-10-17 | 25.316 | 27.41 | 21.33 | 16.34 |
| 2020-10-18 | 25.316 | 27.41 | 21.33 | 16.13 |
| 2020-10-19 | 26.619 | 29.18 | 20.72 | 17 |
| 2020-10-20 | 27.629 | 29.35 | 21.88 | 16.63 |
| 2020-10-21 | 29.449 | 28.65 | 21.71 | 17.33 |
| 2020-10-22 | 28.988 | 28.11 | 23.55 | 17.16 |
| 2020-10-23 | 28.157 | 27.55 | 22.25 | 17.16 |
| 2020-10-24 | 28.157 | 27.55 | 22.25 | 17.16 |
| 2020-10-25 | 28.157 | 27.55 | 22.25 | 16.51 |
| 2020-10-26 | 31.756 | 32.46 | 23.28 | 17.05 |
| 2020-10-27 | 32.74 | 33.35 | 23.53 | 20.53 |
| 2020-10-28 | 38.259 | 40.28 | 24.23 | 20.53 |
| 2020-10-29 | 37.55 | 37.59 | 26.82 | 20.53 |
| 2020-10-30 | 35.347 | 38.02 | 31 | 20.53 |
| 2020-10-31 | 35.347 | 38.02 | 31 | 20.53 |
| 2020-11-01 | 35.347 | 38.02 | 31 | 26.97 |
| 2020-11-02 | 35.233 | 37.13 | 27.65 | 25.66 |
| 2020-11-03 | 32.763 | 35.55 | 27.65 | 27.25 |
| 2020-11-04 | 28.002 | 29.57 | 24.83 | 24.2 |
| 2020-11-05 | 26.372 | 27.58 | 20.67 | 21.17 |
| 2020-11-06 | 25.615 | 24.86 | 20.94 | 21.17 |
| 2020-11-07 | 25.615 | 24.86 | 20.94 | 21.17 |
| 2020-11-08 | 25.615 | 24.86 | 20.94 | 19.35 |
| 2020-11-09 | 23.863 | 25.75 | 20.53 | 19.65 |
| 2020-11-10 | 25.08 | 24.8 | 22.94 | 18.7 |
| 2020-11-11 | 23.126 | 23.45 | 21.32 | 17.54 |
| 2020-11-12 | 23.302 | 25.35 | 21.47 | 16.68 |
| 2020-11-13 | 23.143 | 23.1 | 21.79 | 16.68 |
| 2020-11-14 | 23.143 | 23.1 | 21.79 | 16.68 |
| 2020-11-15 | 23.143 | 23.1 | 21.79 | 16.84 |
| 2020-11-16 | 22.385 | 22.45 | 22.83 | 17.16 |
| 2020-11-17 | 22.253 | 22.71 | 22.82 | 15.66 |
| 2020-11-18 | 20.903 | 23.84 | 22.47 | 15.39 |
| 2020-11-19 | 21.971 | 23.11 | 21.36 | 15.5 |
| 2020-11-20 | 21.439 | 23.7 | 21.42 | 15.5 |
| 2020-11-21 | 21.439 | 23.7 | 21.42 | 15.5 |
| 2020-11-22 | 21.439 | 23.7 | 21.42 | 16.55 |
| 2020-11-23 | 22.489 | 22.66 | 21.42 | 14.33 |
| 2020-11-24 | 21.367 | 21.64 | 21.77 | 16.9 |
| 2020-11-25 | 20.778 | 21.25 | 23.13 | 14.91 |
| 2020-11-26 | 20.235 | 21.25 | 21.82 | 17.32 |
| 2020-11-27 | 20.079 | 20.84 | 21.45 | 17.32 |
| 2020-11-28 | 20.079 | 20.84 | 21.45 | 17.32 |
| 2020-11-29 | 20.079 | 20.84 | 21.45 | 21.09 |
| 2020-11-30 | 22.915 | 20.57 | 22.83 | 21.09 |
| 2020-12-01 | 21.301 | 20.77 | 22.7 | 21.09 |
| 2020-12-02 | 21.694 | 21.17 | 21.82 | 20.55 |
| 2020-12-03 | 21.317 | 21.28 | 21.5 | 19.42 |
| 2020-12-04 | 20.819 | 20.79 | 20.13 | 19.42 |
| 2020-12-05 | 20.819 | 20.79 | 20.13 | 19.42 |
| 2020-12-06 | 20.819 | 20.79 | 20.13 | 17.78 |
| 2020-12-07 | 21.436 | 21.3 | 20.57 | 19.05 |
| 2020-12-08 | 20.535 | 20.68 | 19.37 | 19.26 |
| 2020-12-09 | 20.019 | 22.27 | 19.71 | 19.26 |
| 2020-12-10 | 20.662 | 22.52 | 19.01 | 19.53 |
| 2020-12-11 | 23.614 | 23.31 | 17.85 | 19.53 |
| 2020-12-12 | 23.614 | 23.31 | 17.85 | 19.53 |
| 2020-12-13 | 23.614 | 23.31 | 17.85 | 19.34 |
| 2020-12-14 | 22.521 | 24.72 | 19.18 | 20.11 |
| 2020-12-15 | 21.73 | 22.89 | 19.09 | 20.02 |
| 2020-12-16 | 21.137 | 22.5 | 19.37 | 19.75 |
| 2020-12-17 | 20.51 | 21.93 | 18.48 | 17.95 |
| 2020-12-18 | 21.625 | 21.57 | 18.16 | 17.95 |
| 2020-12-19 | 21.625 | 21.57 | 18.16 | 17.95 |
| 2020-12-20 | 21.625 | 21.57 | 18.16 | 26.42 |
| 2020-12-21 | 27.264 | 25.16 | 19.59 | 26.16 |
| 2020-12-22 | 25.207 | 24.23 | 22.1 | 17.9 |
| 2020-12-23 | 23.153 | 23.31 | 19.94 | 16.85 |
| 2020-12-24 | 23.153 | 21.53 | 19.52 | 17.5 |
| 2020-12-25 | 23.153 | 21.53 | 18.63 | 17.5 |
| 2020-12-26 | 23.153 | 21.53 | 18.63 | 17.5 |
| 2020-12-27 | 23.153 | 21.53 | 18.63 | 17.37 |
| 2020-12-28 | 21.705 | 21.7 | 18.63 | 18.74 |
| 2020-12-29 | 22.383 | 23.08 | 18.63 | 18.36 |
| 2020-12-30 | 23.369 | 22.77 | 18.63 | 17.7 |
| 2020-12-31 | 23.369 | 22.75 | 18.63 | 18.45 |
| 2021-01-01 | 23.369 | 22.75 | 18.63 | 18.45 |
| 2021-01-02 | 23.369 | 22.75 | 18.63 | 18.45 |
| 2021-01-03 | 23.369 | 22.75 | 18.63 | 18.49 |
| 2021-01-04 | 24.842 | 26.97 | 20.9 | 18.06 |
| 2021-01-05 | 25.199 | 25.34 | 22.5 | 18.65 |
| 2021-01-06 | 21.442 | 25.07 | 21.08 | 17.89 |
| 2021-01-07 | 21.015 | 22.37 | 20.56 | 16.81 |
| 2021-01-08 | 20.528 | 21.56 | 20.05 | 16.81 |
| 2021-01-09 | 20.528 | 21.56 | 20.05 | 16.81 |
| 2021-01-10 | 20.528 | 21.56 | 20.05 | 17.04 |
| 2021-01-11 | 21.98 | 24.08 | 20.05 | 18.25 |
| 2021-01-12 | 21.952 | 23.33 | 21.52 | 17.41 |
| 2021-01-13 | 21.094 | 22.21 | 20.62 | 17 |
| 2021-01-14 | 19.693 | 23.25 | 22.51 | 17.8 |
| 2021-01-15 | 22.434 | 24.34 | 23.38 | 17.8 |
| 2021-01-16 | 22.434 | 24.34 | 23.38 | 17.8 |
| 2021-01-17 | 22.434 | 24.34 | 23.38 | 19.27 |
| 2021-01-18 | 21.947 | 24.34 | 23.86 | 19.39 |
| 2021-01-19 | 21.749 | 23.24 | 22.68 | 17.56 |
| 2021-01-20 | 20.277 | 21.58 | 23.86 | 16.06 |
| 2021-01-21 | 19.936 | 21.32 | 21.39 | 16.71 |
| 2021-01-22 | 21.317 | 21.91 | 21.5 | 16.71 |
| 2021-01-23 | 21.317 | 21.91 | 21.5 | 16.71 |
| 2021-01-24 | 21.317 | 21.91 | 21.5 | 20.06 |
| 2021-01-25 | 26.006 | 23.19 | 20.93 | 18.87 |
| 2021-01-26 | 23.099 | 23.02 | 23.14 | 18.12 |
| 2021-01-27 | 26.77 | 37.21 | 22.56 | 16.49 |
| 2021-01-28 | 25.929 | 30.21 | 27.63 | 20.56 |
| 2021-01-29 | 29.008 | 33.09 | 28.86 | 20.56 |
| 2021-01-30 | 29.008 | 33.09 | 28.86 | 20.56 |
| 2021-01-31 | 29.008 | 33.09 | 28.86 | 24.11 |
| 2021-02-01 | 27.326 | 30.24 | 24.57 | 22.44 |
| 2021-02-02 | 24.022 | 25.56 | 23.76 | 18.92 |
| 2021-02-03 | 22.72 | 22.91 | 21.5 | 18.89 |
| 2021-02-04 | 21.373 | 21.77 | 22.33 | 18.21 |
| 2021-02-05 | 20.644 | 20.87 | 21.26 | 18.21 |
| 2021-02-06 | 20.644 | 20.87 | 21.26 | 18.21 |
| 2021-02-07 | 20.644 | 20.87 | 21.26 | 16.15 |
| 2021-02-08 | 20.438 | 21.24 | 21.95 | 16.72 |
| 2021-02-09 | 21.123 | 21.63 | 21.61 | 15.97 |
| 2021-02-10 | 22.468 | 21.99 | 22.57 | 15.61 |
| 2021-02-11 | 21.208 | 21.25 | 22.57 | 16.35 |
| 2021-02-12 | 20.062 | 19.97 | 22.25 | 16.35 |
| 2021-02-13 | 20.062 | 19.97 | 22.25 | 16.35 |
| 2021-02-14 | 20.062 | 19.97 | 22.25 | 16.85 |
| 2021-02-15 | 20.153 | 19.97 | 23.27 | 15.74 |
| 2021-02-16 | 20.929 | 21.46 | 24.39 | 16.2 |
| 2021-02-17 | 21.829 | 21.5 | 24.08 | 17.26 |
| 2021-02-18 | 22.523 | 22.49 | 23.22 | 17.26 |
| 2021-02-19 | 20.484 | 22.05 | 24.24 | 17.26 |
| 2021-02-20 | 20.484 | 22.05 | 24.24 | 17.26 |
| 2021-02-21 | 20.484 | 22.05 | 24.24 | 15.91 |
| 2021-02-22 | 21.693 | 23.45 | 25.31 | 18.38 |
| 2021-02-23 | 23.132 | 23.11 | 25.31 | 22.23 |
| 2021-02-24 | 21.426 | 21.34 | 26.77 | 16.83 |
| 2021-02-25 | 22.096 | 28.89 | 23.96 | 21.37 |
| 2021-02-26 | 26.863 | 27.95 | 28.6 | 21.37 |
| 2021-02-27 | 26.863 | 27.95 | 28.6 | 21.37 |
| 2021-02-28 | 26.863 | 27.95 | 28.6 | 21.46 |